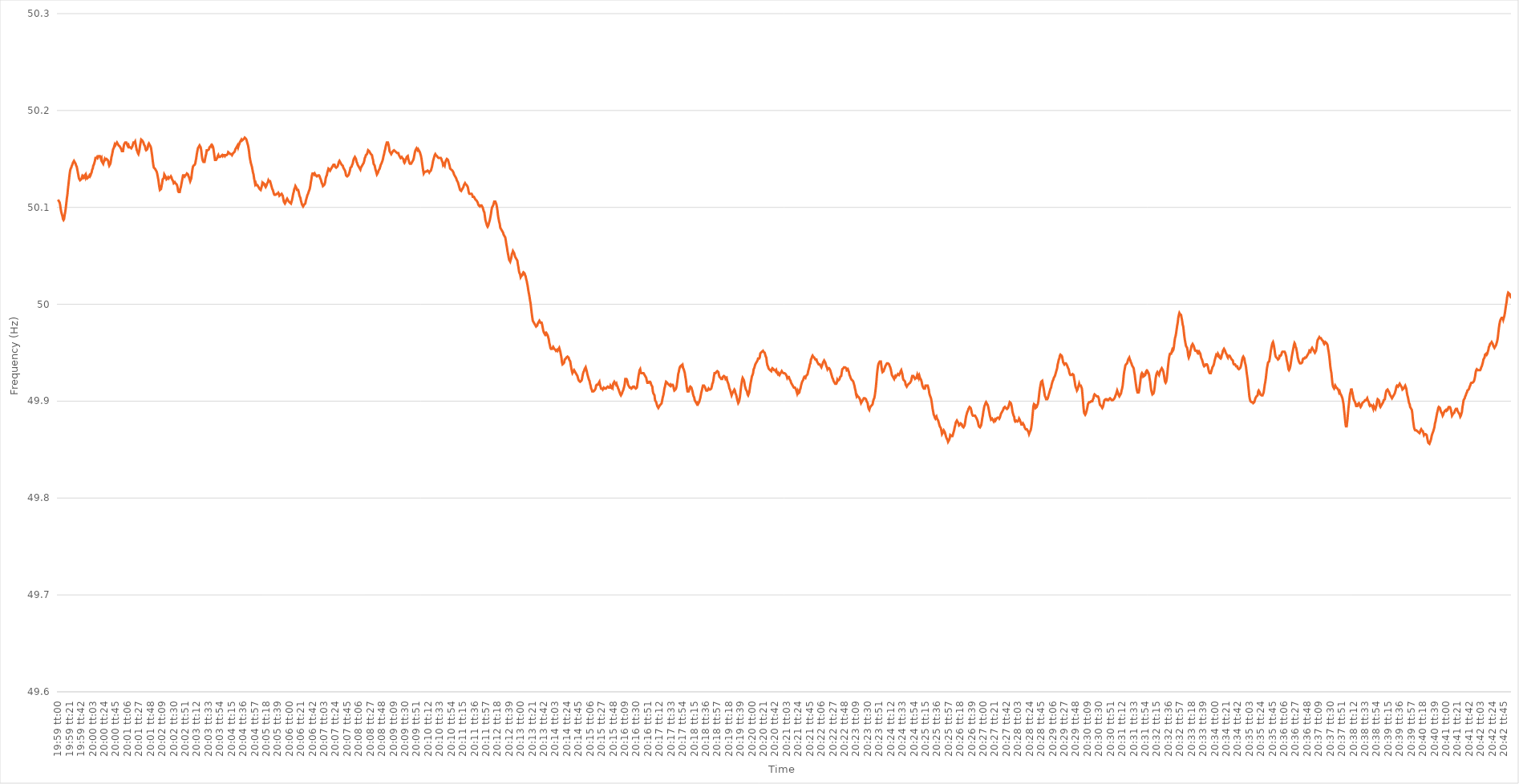
| Category | Series 0 |
|---|---|
| 0.8326388888888889 | 50.108 |
| 0.8326504629629629 | 50.107 |
| 0.832662037037037 | 50.107 |
| 0.8326736111111112 | 50.105 |
| 0.8326851851851852 | 50.102 |
| 0.8326967592592592 | 50.098 |
| 0.8327083333333333 | 50.095 |
| 0.8327199074074074 | 50.093 |
| 0.8327314814814816 | 50.091 |
| 0.8327430555555555 | 50.088 |
| 0.8327546296296297 | 50.087 |
| 0.8327662037037037 | 50.088 |
| 0.8327777777777778 | 50.092 |
| 0.8327893518518518 | 50.095 |
| 0.8328009259259259 | 50.099 |
| 0.8328125000000001 | 50.104 |
| 0.8328240740740741 | 50.109 |
| 0.8328356481481481 | 50.113 |
| 0.8328472222222222 | 50.119 |
| 0.8328587962962963 | 50.124 |
| 0.8328703703703703 | 50.129 |
| 0.8328819444444444 | 50.134 |
| 0.8328935185185186 | 50.138 |
| 0.8329050925925926 | 50.14 |
| 0.8329166666666666 | 50.141 |
| 0.8329282407407407 | 50.143 |
| 0.8329398148148148 | 50.144 |
| 0.832951388888889 | 50.146 |
| 0.8329629629629629 | 50.147 |
| 0.832974537037037 | 50.148 |
| 0.8329861111111111 | 50.147 |
| 0.8329976851851852 | 50.146 |
| 0.8330092592592592 | 50.145 |
| 0.8330208333333333 | 50.143 |
| 0.8330324074074075 | 50.142 |
| 0.8330439814814815 | 50.139 |
| 0.8330555555555555 | 50.136 |
| 0.8330671296296296 | 50.133 |
| 0.8330787037037037 | 50.13 |
| 0.8330902777777777 | 50.129 |
| 0.8331018518518518 | 50.128 |
| 0.833113425925926 | 50.128 |
| 0.833125 | 50.129 |
| 0.833136574074074 | 50.13 |
| 0.8331481481481481 | 50.132 |
| 0.8331597222222222 | 50.131 |
| 0.8331712962962964 | 50.132 |
| 0.8331828703703703 | 50.131 |
| 0.8331944444444445 | 50.132 |
| 0.8332060185185185 | 50.133 |
| 0.8332175925925926 | 50.131 |
| 0.8332291666666666 | 50.133 |
| 0.8332407407407407 | 50.131 |
| 0.8332523148148149 | 50.13 |
| 0.8332638888888889 | 50.13 |
| 0.833275462962963 | 50.131 |
| 0.833287037037037 | 50.132 |
| 0.8332986111111111 | 50.133 |
| 0.8333101851851853 | 50.132 |
| 0.8333217592592592 | 50.133 |
| 0.8333333333333334 | 50.135 |
| 0.8333449074074074 | 50.136 |
| 0.8333564814814814 | 50.139 |
| 0.8333680555555555 | 50.14 |
| 0.8333796296296296 | 50.143 |
| 0.8333912037037038 | 50.144 |
| 0.8334027777777777 | 50.146 |
| 0.8334143518518519 | 50.148 |
| 0.8334259259259259 | 50.151 |
| 0.8334375 | 50.151 |
| 0.833449074074074 | 50.151 |
| 0.8334606481481481 | 50.152 |
| 0.8334722222222223 | 50.151 |
| 0.8334837962962963 | 50.152 |
| 0.8334953703703704 | 50.153 |
| 0.8335069444444444 | 50.153 |
| 0.8335185185185185 | 50.153 |
| 0.8335300925925927 | 50.152 |
| 0.8335416666666666 | 50.15 |
| 0.8335532407407408 | 50.151 |
| 0.8335648148148148 | 50.147 |
| 0.8335763888888889 | 50.146 |
| 0.8335879629629629 | 50.145 |
| 0.833599537037037 | 50.147 |
| 0.8336111111111112 | 50.148 |
| 0.8336226851851851 | 50.15 |
| 0.8336342592592593 | 50.149 |
| 0.8336458333333333 | 50.149 |
| 0.8336574074074075 | 50.15 |
| 0.8336689814814814 | 50.15 |
| 0.8336805555555555 | 50.149 |
| 0.8336921296296297 | 50.148 |
| 0.8337037037037037 | 50.145 |
| 0.8337152777777778 | 50.143 |
| 0.8337268518518518 | 50.143 |
| 0.833738425925926 | 50.145 |
| 0.8337500000000001 | 50.148 |
| 0.833761574074074 | 50.152 |
| 0.8337731481481482 | 50.154 |
| 0.8337847222222222 | 50.157 |
| 0.8337962962962964 | 50.16 |
| 0.8338078703703703 | 50.161 |
| 0.8338194444444444 | 50.163 |
| 0.8338310185185186 | 50.165 |
| 0.8338425925925925 | 50.164 |
| 0.8338541666666667 | 50.164 |
| 0.8338657407407407 | 50.166 |
| 0.8338773148148149 | 50.167 |
| 0.8338888888888888 | 50.166 |
| 0.8339004629629629 | 50.165 |
| 0.8339120370370371 | 50.164 |
| 0.8339236111111111 | 50.164 |
| 0.8339351851851852 | 50.163 |
| 0.8339467592592592 | 50.163 |
| 0.8339583333333334 | 50.161 |
| 0.8339699074074075 | 50.16 |
| 0.8339814814814814 | 50.158 |
| 0.8339930555555556 | 50.158 |
| 0.8340046296296296 | 50.158 |
| 0.8340162037037038 | 50.162 |
| 0.8340277777777777 | 50.165 |
| 0.8340393518518519 | 50.165 |
| 0.834050925925926 | 50.167 |
| 0.8340624999999999 | 50.167 |
| 0.8340740740740741 | 50.167 |
| 0.8340856481481481 | 50.166 |
| 0.8340972222222223 | 50.164 |
| 0.8341087962962962 | 50.163 |
| 0.8341203703703703 | 50.164 |
| 0.8341319444444445 | 50.162 |
| 0.8341435185185185 | 50.162 |
| 0.8341550925925926 | 50.162 |
| 0.8341666666666666 | 50.162 |
| 0.8341782407407408 | 50.161 |
| 0.8341898148148149 | 50.162 |
| 0.8342013888888888 | 50.163 |
| 0.834212962962963 | 50.165 |
| 0.834224537037037 | 50.167 |
| 0.8342361111111112 | 50.167 |
| 0.8342476851851851 | 50.167 |
| 0.8342592592592593 | 50.168 |
| 0.8342708333333334 | 50.165 |
| 0.8342824074074073 | 50.162 |
| 0.8342939814814815 | 50.159 |
| 0.8343055555555555 | 50.158 |
| 0.8343171296296297 | 50.156 |
| 0.8343287037037036 | 50.155 |
| 0.8343402777777778 | 50.157 |
| 0.8343518518518519 | 50.16 |
| 0.8343634259259259 | 50.164 |
| 0.834375 | 50.167 |
| 0.834386574074074 | 50.17 |
| 0.8343981481481482 | 50.17 |
| 0.8344097222222223 | 50.169 |
| 0.8344212962962962 | 50.168 |
| 0.8344328703703704 | 50.167 |
| 0.8344444444444444 | 50.165 |
| 0.8344560185185186 | 50.164 |
| 0.8344675925925925 | 50.163 |
| 0.8344791666666667 | 50.16 |
| 0.8344907407407408 | 50.159 |
| 0.8345023148148148 | 50.159 |
| 0.8345138888888889 | 50.16 |
| 0.8345254629629629 | 50.162 |
| 0.8345370370370371 | 50.165 |
| 0.834548611111111 | 50.166 |
| 0.8345601851851852 | 50.166 |
| 0.8345717592592593 | 50.164 |
| 0.8345833333333333 | 50.163 |
| 0.8345949074074074 | 50.161 |
| 0.8346064814814814 | 50.157 |
| 0.8346180555555556 | 50.153 |
| 0.8346296296296297 | 50.148 |
| 0.8346412037037036 | 50.144 |
| 0.8346527777777778 | 50.141 |
| 0.8346643518518518 | 50.141 |
| 0.834675925925926 | 50.14 |
| 0.8346874999999999 | 50.139 |
| 0.8346990740740741 | 50.138 |
| 0.8347106481481482 | 50.137 |
| 0.8347222222222223 | 50.135 |
| 0.8347337962962963 | 50.132 |
| 0.8347453703703703 | 50.129 |
| 0.8347569444444445 | 50.125 |
| 0.8347685185185184 | 50.121 |
| 0.8347800925925926 | 50.118 |
| 0.8347916666666667 | 50.118 |
| 0.8348032407407407 | 50.119 |
| 0.8348148148148148 | 50.122 |
| 0.8348263888888888 | 50.125 |
| 0.834837962962963 | 50.129 |
| 0.8348495370370371 | 50.129 |
| 0.834861111111111 | 50.13 |
| 0.8348726851851852 | 50.134 |
| 0.8348842592592592 | 50.134 |
| 0.8348958333333334 | 50.132 |
| 0.8349074074074073 | 50.131 |
| 0.8349189814814815 | 50.129 |
| 0.8349305555555556 | 50.129 |
| 0.8349421296296297 | 50.13 |
| 0.8349537037037037 | 50.131 |
| 0.8349652777777777 | 50.13 |
| 0.8349768518518519 | 50.131 |
| 0.834988425925926 | 50.131 |
| 0.835 | 50.131 |
| 0.8350115740740741 | 50.132 |
| 0.8350231481481482 | 50.131 |
| 0.8350347222222222 | 50.129 |
| 0.8350462962962962 | 50.128 |
| 0.8350578703703704 | 50.127 |
| 0.8350694444444445 | 50.125 |
| 0.8350810185185185 | 50.125 |
| 0.8350925925925926 | 50.126 |
| 0.8351041666666666 | 50.125 |
| 0.8351157407407408 | 50.125 |
| 0.8351273148148147 | 50.124 |
| 0.8351388888888889 | 50.123 |
| 0.835150462962963 | 50.121 |
| 0.8351620370370371 | 50.117 |
| 0.8351736111111111 | 50.116 |
| 0.8351851851851851 | 50.116 |
| 0.8351967592592593 | 50.116 |
| 0.8352083333333334 | 50.119 |
| 0.8352199074074074 | 50.121 |
| 0.8352314814814815 | 50.124 |
| 0.8352430555555556 | 50.127 |
| 0.8352546296296296 | 50.13 |
| 0.8352662037037036 | 50.133 |
| 0.8352777777777778 | 50.133 |
| 0.8352893518518519 | 50.133 |
| 0.8353009259259259 | 50.132 |
| 0.8353125 | 50.133 |
| 0.835324074074074 | 50.133 |
| 0.8353356481481482 | 50.134 |
| 0.8353472222222221 | 50.135 |
| 0.8353587962962963 | 50.135 |
| 0.8353703703703704 | 50.134 |
| 0.8353819444444445 | 50.132 |
| 0.8353935185185185 | 50.131 |
| 0.8354050925925925 | 50.129 |
| 0.8354166666666667 | 50.127 |
| 0.8354282407407408 | 50.127 |
| 0.8354398148148148 | 50.13 |
| 0.8354513888888889 | 50.135 |
| 0.835462962962963 | 50.139 |
| 0.835474537037037 | 50.142 |
| 0.835486111111111 | 50.143 |
| 0.8354976851851852 | 50.143 |
| 0.8355092592592593 | 50.144 |
| 0.8355208333333333 | 50.145 |
| 0.8355324074074074 | 50.148 |
| 0.8355439814814815 | 50.151 |
| 0.8355555555555556 | 50.155 |
| 0.8355671296296295 | 50.158 |
| 0.8355787037037037 | 50.161 |
| 0.8355902777777778 | 50.161 |
| 0.8356018518518519 | 50.163 |
| 0.8356134259259259 | 50.164 |
| 0.835625 | 50.164 |
| 0.8356365740740741 | 50.162 |
| 0.8356481481481483 | 50.159 |
| 0.8356597222222222 | 50.154 |
| 0.8356712962962963 | 50.15 |
| 0.8356828703703704 | 50.148 |
| 0.8356944444444445 | 50.147 |
| 0.8357060185185184 | 50.147 |
| 0.8357175925925926 | 50.147 |
| 0.8357291666666667 | 50.15 |
| 0.8357407407407407 | 50.153 |
| 0.8357523148148148 | 50.155 |
| 0.8357638888888889 | 50.159 |
| 0.835775462962963 | 50.159 |
| 0.8357870370370369 | 50.159 |
| 0.8357986111111111 | 50.159 |
| 0.8358101851851852 | 50.16 |
| 0.8358217592592593 | 50.162 |
| 0.8358333333333333 | 50.162 |
| 0.8358449074074074 | 50.163 |
| 0.8358564814814815 | 50.164 |
| 0.8358680555555557 | 50.163 |
| 0.8358796296296296 | 50.164 |
| 0.8358912037037037 | 50.163 |
| 0.8359027777777778 | 50.161 |
| 0.8359143518518519 | 50.157 |
| 0.8359259259259259 | 50.153 |
| 0.8359375 | 50.149 |
| 0.8359490740740741 | 50.149 |
| 0.8359606481481481 | 50.149 |
| 0.8359722222222222 | 50.149 |
| 0.8359837962962963 | 50.151 |
| 0.8359953703703704 | 50.153 |
| 0.8360069444444443 | 50.154 |
| 0.8360185185185185 | 50.152 |
| 0.8360300925925926 | 50.152 |
| 0.8360416666666667 | 50.152 |
| 0.8360532407407407 | 50.152 |
| 0.8360648148148148 | 50.153 |
| 0.8360763888888889 | 50.153 |
| 0.8360879629629631 | 50.154 |
| 0.836099537037037 | 50.153 |
| 0.8361111111111111 | 50.154 |
| 0.8361226851851852 | 50.154 |
| 0.8361342592592593 | 50.154 |
| 0.8361458333333333 | 50.153 |
| 0.8361574074074074 | 50.154 |
| 0.8361689814814816 | 50.154 |
| 0.8361805555555555 | 50.154 |
| 0.8361921296296296 | 50.154 |
| 0.8362037037037037 | 50.155 |
| 0.8362152777777778 | 50.157 |
| 0.8362268518518517 | 50.157 |
| 0.8362384259259259 | 50.156 |
| 0.83625 | 50.156 |
| 0.8362615740740741 | 50.155 |
| 0.8362731481481481 | 50.155 |
| 0.8362847222222222 | 50.155 |
| 0.8362962962962963 | 50.154 |
| 0.8363078703703705 | 50.155 |
| 0.8363194444444444 | 50.156 |
| 0.8363310185185185 | 50.156 |
| 0.8363425925925926 | 50.157 |
| 0.8363541666666667 | 50.158 |
| 0.8363657407407407 | 50.16 |
| 0.8363773148148148 | 50.161 |
| 0.836388888888889 | 50.162 |
| 0.836400462962963 | 50.163 |
| 0.836412037037037 | 50.164 |
| 0.8364236111111111 | 50.162 |
| 0.8364351851851852 | 50.164 |
| 0.8364467592592592 | 50.165 |
| 0.8364583333333333 | 50.167 |
| 0.8364699074074075 | 50.168 |
| 0.8364814814814815 | 50.169 |
| 0.8364930555555555 | 50.17 |
| 0.8365046296296296 | 50.169 |
| 0.8365162037037037 | 50.169 |
| 0.8365277777777779 | 50.17 |
| 0.8365393518518518 | 50.17 |
| 0.836550925925926 | 50.171 |
| 0.8365625 | 50.172 |
| 0.8365740740740741 | 50.172 |
| 0.8365856481481481 | 50.171 |
| 0.8365972222222222 | 50.17 |
| 0.8366087962962964 | 50.17 |
| 0.8366203703703704 | 50.166 |
| 0.8366319444444444 | 50.164 |
| 0.8366435185185185 | 50.161 |
| 0.8366550925925926 | 50.157 |
| 0.8366666666666666 | 50.152 |
| 0.8366782407407407 | 50.149 |
| 0.8366898148148149 | 50.146 |
| 0.8367013888888889 | 50.144 |
| 0.8367129629629629 | 50.142 |
| 0.836724537037037 | 50.139 |
| 0.8367361111111111 | 50.136 |
| 0.8367476851851853 | 50.134 |
| 0.8367592592592592 | 50.13 |
| 0.8367708333333334 | 50.127 |
| 0.8367824074074074 | 50.124 |
| 0.8367939814814815 | 50.125 |
| 0.8368055555555555 | 50.123 |
| 0.8368171296296296 | 50.123 |
| 0.8368287037037038 | 50.123 |
| 0.8368402777777778 | 50.122 |
| 0.8368518518518518 | 50.121 |
| 0.8368634259259259 | 50.12 |
| 0.836875 | 50.119 |
| 0.836886574074074 | 50.119 |
| 0.8368981481481481 | 50.118 |
| 0.8369097222222223 | 50.12 |
| 0.8369212962962963 | 50.122 |
| 0.8369328703703703 | 50.125 |
| 0.8369444444444444 | 50.124 |
| 0.8369560185185185 | 50.125 |
| 0.8369675925925927 | 50.125 |
| 0.8369791666666666 | 50.124 |
| 0.8369907407407408 | 50.122 |
| 0.8370023148148148 | 50.121 |
| 0.837013888888889 | 50.122 |
| 0.8370254629629629 | 50.122 |
| 0.837037037037037 | 50.125 |
| 0.8370486111111112 | 50.126 |
| 0.8370601851851852 | 50.128 |
| 0.8370717592592593 | 50.127 |
| 0.8370833333333333 | 50.127 |
| 0.8370949074074074 | 50.127 |
| 0.8371064814814816 | 50.125 |
| 0.8371180555555555 | 50.123 |
| 0.8371296296296297 | 50.121 |
| 0.8371412037037037 | 50.119 |
| 0.8371527777777777 | 50.118 |
| 0.8371643518518518 | 50.116 |
| 0.8371759259259259 | 50.114 |
| 0.8371875000000001 | 50.113 |
| 0.837199074074074 | 50.113 |
| 0.8372106481481482 | 50.113 |
| 0.8372222222222222 | 50.113 |
| 0.8372337962962964 | 50.114 |
| 0.8372453703703703 | 50.114 |
| 0.8372569444444444 | 50.114 |
| 0.8372685185185186 | 50.115 |
| 0.8372800925925926 | 50.114 |
| 0.8372916666666667 | 50.112 |
| 0.8373032407407407 | 50.112 |
| 0.8373148148148148 | 50.113 |
| 0.837326388888889 | 50.113 |
| 0.8373379629629629 | 50.114 |
| 0.8373495370370371 | 50.113 |
| 0.8373611111111111 | 50.112 |
| 0.8373726851851852 | 50.109 |
| 0.8373842592592592 | 50.106 |
| 0.8373958333333333 | 50.105 |
| 0.8374074074074075 | 50.104 |
| 0.8374189814814814 | 50.105 |
| 0.8374305555555556 | 50.107 |
| 0.8374421296296296 | 50.108 |
| 0.8374537037037038 | 50.109 |
| 0.8374652777777777 | 50.108 |
| 0.8374768518518518 | 50.107 |
| 0.837488425925926 | 50.106 |
| 0.8375 | 50.106 |
| 0.8375115740740741 | 50.105 |
| 0.8375231481481481 | 50.105 |
| 0.8375347222222222 | 50.104 |
| 0.8375462962962964 | 50.106 |
| 0.8375578703703703 | 50.108 |
| 0.8375694444444445 | 50.111 |
| 0.8375810185185185 | 50.114 |
| 0.8375925925925927 | 50.116 |
| 0.8376041666666666 | 50.119 |
| 0.8376157407407407 | 50.12 |
| 0.8376273148148149 | 50.122 |
| 0.8376388888888888 | 50.122 |
| 0.837650462962963 | 50.12 |
| 0.837662037037037 | 50.118 |
| 0.8376736111111112 | 50.118 |
| 0.8376851851851851 | 50.118 |
| 0.8376967592592592 | 50.116 |
| 0.8377083333333334 | 50.113 |
| 0.8377199074074074 | 50.111 |
| 0.8377314814814815 | 50.11 |
| 0.8377430555555555 | 50.107 |
| 0.8377546296296297 | 50.107 |
| 0.8377662037037038 | 50.103 |
| 0.8377777777777777 | 50.102 |
| 0.8377893518518519 | 50.101 |
| 0.8378009259259259 | 50.101 |
| 0.8378125000000001 | 50.103 |
| 0.837824074074074 | 50.103 |
| 0.8378356481481481 | 50.104 |
| 0.8378472222222223 | 50.107 |
| 0.8378587962962962 | 50.109 |
| 0.8378703703703704 | 50.111 |
| 0.8378819444444444 | 50.113 |
| 0.8378935185185186 | 50.114 |
| 0.8379050925925925 | 50.116 |
| 0.8379166666666666 | 50.116 |
| 0.8379282407407408 | 50.119 |
| 0.8379398148148148 | 50.122 |
| 0.8379513888888889 | 50.126 |
| 0.8379629629629629 | 50.129 |
| 0.8379745370370371 | 50.133 |
| 0.8379861111111112 | 50.135 |
| 0.8379976851851851 | 50.135 |
| 0.8380092592592593 | 50.135 |
| 0.8380208333333333 | 50.134 |
| 0.8380324074074075 | 50.135 |
| 0.8380439814814814 | 50.135 |
| 0.8380555555555556 | 50.133 |
| 0.8380671296296297 | 50.133 |
| 0.8380787037037036 | 50.132 |
| 0.8380902777777778 | 50.132 |
| 0.8381018518518518 | 50.133 |
| 0.838113425925926 | 50.133 |
| 0.8381249999999999 | 50.133 |
| 0.838136574074074 | 50.132 |
| 0.8381481481481482 | 50.13 |
| 0.8381597222222222 | 50.129 |
| 0.8381712962962963 | 50.127 |
| 0.8381828703703703 | 50.125 |
| 0.8381944444444445 | 50.124 |
| 0.8382060185185186 | 50.122 |
| 0.8382175925925925 | 50.122 |
| 0.8382291666666667 | 50.123 |
| 0.8382407407407407 | 50.124 |
| 0.8382523148148149 | 50.126 |
| 0.8382638888888888 | 50.13 |
| 0.838275462962963 | 50.132 |
| 0.8382870370370371 | 50.133 |
| 0.8382986111111111 | 50.136 |
| 0.8383101851851852 | 50.138 |
| 0.8383217592592592 | 50.14 |
| 0.8383333333333334 | 50.14 |
| 0.8383449074074073 | 50.139 |
| 0.8383564814814815 | 50.138 |
| 0.8383680555555556 | 50.138 |
| 0.8383796296296296 | 50.14 |
| 0.8383912037037037 | 50.141 |
| 0.8384027777777777 | 50.142 |
| 0.8384143518518519 | 50.143 |
| 0.838425925925926 | 50.144 |
| 0.8384375 | 50.144 |
| 0.8384490740740741 | 50.144 |
| 0.8384606481481481 | 50.142 |
| 0.8384722222222223 | 50.142 |
| 0.8384837962962962 | 50.141 |
| 0.8384953703703704 | 50.141 |
| 0.8385069444444445 | 50.142 |
| 0.8385185185185186 | 50.143 |
| 0.8385300925925926 | 50.145 |
| 0.8385416666666666 | 50.147 |
| 0.8385532407407408 | 50.148 |
| 0.8385648148148147 | 50.148 |
| 0.8385763888888889 | 50.146 |
| 0.838587962962963 | 50.145 |
| 0.838599537037037 | 50.144 |
| 0.8386111111111111 | 50.144 |
| 0.8386226851851851 | 50.143 |
| 0.8386342592592593 | 50.141 |
| 0.8386458333333334 | 50.14 |
| 0.8386574074074074 | 50.139 |
| 0.8386689814814815 | 50.138 |
| 0.8386805555555555 | 50.136 |
| 0.8386921296296297 | 50.133 |
| 0.8387037037037036 | 50.133 |
| 0.8387152777777778 | 50.132 |
| 0.8387268518518519 | 50.132 |
| 0.838738425925926 | 50.133 |
| 0.83875 | 50.134 |
| 0.838761574074074 | 50.136 |
| 0.8387731481481482 | 50.138 |
| 0.8387847222222221 | 50.141 |
| 0.8387962962962963 | 50.141 |
| 0.8388078703703704 | 50.142 |
| 0.8388194444444445 | 50.144 |
| 0.8388310185185185 | 50.145 |
| 0.8388425925925925 | 50.148 |
| 0.8388541666666667 | 50.15 |
| 0.8388657407407408 | 50.151 |
| 0.8388773148148148 | 50.152 |
| 0.8388888888888889 | 50.151 |
| 0.838900462962963 | 50.15 |
| 0.8389120370370371 | 50.147 |
| 0.838923611111111 | 50.146 |
| 0.8389351851851852 | 50.144 |
| 0.8389467592592593 | 50.143 |
| 0.8389583333333334 | 50.142 |
| 0.8389699074074074 | 50.141 |
| 0.8389814814814814 | 50.14 |
| 0.8389930555555556 | 50.139 |
| 0.8390046296296297 | 50.141 |
| 0.8390162037037037 | 50.141 |
| 0.8390277777777778 | 50.143 |
| 0.8390393518518519 | 50.143 |
| 0.8390509259259259 | 50.145 |
| 0.8390624999999999 | 50.146 |
| 0.8390740740740741 | 50.148 |
| 0.8390856481481482 | 50.151 |
| 0.8390972222222222 | 50.152 |
| 0.8391087962962963 | 50.154 |
| 0.8391203703703703 | 50.154 |
| 0.8391319444444445 | 50.155 |
| 0.8391435185185184 | 50.157 |
| 0.8391550925925926 | 50.159 |
| 0.8391666666666667 | 50.159 |
| 0.8391782407407408 | 50.158 |
| 0.8391898148148148 | 50.157 |
| 0.8392013888888888 | 50.156 |
| 0.839212962962963 | 50.155 |
| 0.8392245370370371 | 50.155 |
| 0.8392361111111111 | 50.154 |
| 0.8392476851851852 | 50.151 |
| 0.8392592592592593 | 50.149 |
| 0.8392708333333333 | 50.145 |
| 0.8392824074074073 | 50.144 |
| 0.8392939814814815 | 50.143 |
| 0.8393055555555556 | 50.14 |
| 0.8393171296296296 | 50.138 |
| 0.8393287037037037 | 50.136 |
| 0.8393402777777778 | 50.134 |
| 0.8393518518518519 | 50.135 |
| 0.8393634259259258 | 50.136 |
| 0.839375 | 50.138 |
| 0.8393865740740741 | 50.138 |
| 0.8393981481481482 | 50.14 |
| 0.8394097222222222 | 50.142 |
| 0.8394212962962962 | 50.144 |
| 0.8394328703703704 | 50.145 |
| 0.8394444444444445 | 50.145 |
| 0.8394560185185185 | 50.148 |
| 0.8394675925925926 | 50.15 |
| 0.8394791666666667 | 50.153 |
| 0.8394907407407407 | 50.155 |
| 0.8395023148148147 | 50.158 |
| 0.8395138888888889 | 50.16 |
| 0.839525462962963 | 50.163 |
| 0.839537037037037 | 50.165 |
| 0.8395486111111111 | 50.167 |
| 0.8395601851851852 | 50.167 |
| 0.8395717592592593 | 50.167 |
| 0.8395833333333332 | 50.165 |
| 0.8395949074074074 | 50.162 |
| 0.8396064814814815 | 50.158 |
| 0.8396180555555556 | 50.157 |
| 0.8396296296296296 | 50.156 |
| 0.8396412037037037 | 50.155 |
| 0.8396527777777778 | 50.156 |
| 0.839664351851852 | 50.157 |
| 0.8396759259259259 | 50.158 |
| 0.8396875 | 50.158 |
| 0.8396990740740741 | 50.159 |
| 0.8397106481481482 | 50.159 |
| 0.8397222222222221 | 50.158 |
| 0.8397337962962963 | 50.158 |
| 0.8397453703703704 | 50.157 |
| 0.8397569444444444 | 50.157 |
| 0.8397685185185185 | 50.156 |
| 0.8397800925925926 | 50.156 |
| 0.8397916666666667 | 50.156 |
| 0.8398032407407406 | 50.154 |
| 0.8398148148148148 | 50.153 |
| 0.8398263888888889 | 50.153 |
| 0.839837962962963 | 50.151 |
| 0.839849537037037 | 50.151 |
| 0.8398611111111111 | 50.152 |
| 0.8398726851851852 | 50.151 |
| 0.8398842592592594 | 50.151 |
| 0.8398958333333333 | 50.15 |
| 0.8399074074074074 | 50.147 |
| 0.8399189814814815 | 50.146 |
| 0.8399305555555556 | 50.147 |
| 0.8399421296296296 | 50.149 |
| 0.8399537037037037 | 50.15 |
| 0.8399652777777779 | 50.152 |
| 0.8399768518518518 | 50.152 |
| 0.8399884259259259 | 50.153 |
| 0.84 | 50.15 |
| 0.8400115740740741 | 50.148 |
| 0.840023148148148 | 50.146 |
| 0.8400347222222222 | 50.145 |
| 0.8400462962962963 | 50.145 |
| 0.8400578703703704 | 50.145 |
| 0.8400694444444444 | 50.145 |
| 0.8400810185185185 | 50.147 |
| 0.8400925925925926 | 50.148 |
| 0.8401041666666668 | 50.149 |
| 0.8401157407407407 | 50.151 |
| 0.8401273148148148 | 50.154 |
| 0.8401388888888889 | 50.157 |
| 0.840150462962963 | 50.159 |
| 0.840162037037037 | 50.159 |
| 0.8401736111111111 | 50.161 |
| 0.8401851851851853 | 50.16 |
| 0.8401967592592593 | 50.159 |
| 0.8402083333333333 | 50.16 |
| 0.8402199074074074 | 50.16 |
| 0.8402314814814815 | 50.158 |
| 0.8402430555555555 | 50.157 |
| 0.8402546296296296 | 50.155 |
| 0.8402662037037038 | 50.153 |
| 0.8402777777777778 | 50.15 |
| 0.8402893518518518 | 50.146 |
| 0.8403009259259259 | 50.142 |
| 0.8403125 | 50.138 |
| 0.8403240740740742 | 50.135 |
| 0.8403356481481481 | 50.136 |
| 0.8403472222222222 | 50.136 |
| 0.8403587962962963 | 50.137 |
| 0.8403703703703704 | 50.137 |
| 0.8403819444444444 | 50.137 |
| 0.8403935185185185 | 50.137 |
| 0.8404050925925927 | 50.138 |
| 0.8404166666666667 | 50.138 |
| 0.8404282407407407 | 50.137 |
| 0.8404398148148148 | 50.136 |
| 0.8404513888888889 | 50.137 |
| 0.8404629629629629 | 50.137 |
| 0.840474537037037 | 50.138 |
| 0.8404861111111112 | 50.14 |
| 0.8404976851851852 | 50.142 |
| 0.8405092592592592 | 50.145 |
| 0.8405208333333333 | 50.148 |
| 0.8405324074074074 | 50.15 |
| 0.8405439814814816 | 50.152 |
| 0.8405555555555555 | 50.154 |
| 0.8405671296296297 | 50.155 |
| 0.8405787037037037 | 50.154 |
| 0.8405902777777778 | 50.154 |
| 0.8406018518518518 | 50.153 |
| 0.8406134259259259 | 50.152 |
| 0.8406250000000001 | 50.152 |
| 0.8406365740740741 | 50.151 |
| 0.8406481481481481 | 50.151 |
| 0.8406597222222222 | 50.151 |
| 0.8406712962962963 | 50.151 |
| 0.8406828703703703 | 50.151 |
| 0.8406944444444444 | 50.15 |
| 0.8407060185185186 | 50.148 |
| 0.8407175925925926 | 50.147 |
| 0.8407291666666666 | 50.144 |
| 0.8407407407407407 | 50.145 |
| 0.8407523148148148 | 50.144 |
| 0.840763888888889 | 50.143 |
| 0.8407754629629629 | 50.146 |
| 0.840787037037037 | 50.148 |
| 0.8407986111111111 | 50.149 |
| 0.8408101851851852 | 50.15 |
| 0.8408217592592592 | 50.15 |
| 0.8408333333333333 | 50.149 |
| 0.8408449074074075 | 50.147 |
| 0.8408564814814815 | 50.145 |
| 0.8408680555555555 | 50.143 |
| 0.8408796296296296 | 50.14 |
| 0.8408912037037037 | 50.14 |
| 0.8409027777777779 | 50.139 |
| 0.8409143518518518 | 50.139 |
| 0.840925925925926 | 50.138 |
| 0.8409375 | 50.137 |
| 0.840949074074074 | 50.136 |
| 0.8409606481481481 | 50.134 |
| 0.8409722222222222 | 50.134 |
| 0.8409837962962964 | 50.132 |
| 0.8409953703703703 | 50.131 |
| 0.8410069444444445 | 50.13 |
| 0.8410185185185185 | 50.128 |
| 0.8410300925925926 | 50.128 |
| 0.8410416666666666 | 50.126 |
| 0.8410532407407407 | 50.124 |
| 0.8410648148148149 | 50.122 |
| 0.8410763888888889 | 50.12 |
| 0.841087962962963 | 50.118 |
| 0.841099537037037 | 50.118 |
| 0.8411111111111111 | 50.117 |
| 0.8411226851851853 | 50.118 |
| 0.8411342592592592 | 50.119 |
| 0.8411458333333334 | 50.119 |
| 0.8411574074074074 | 50.121 |
| 0.8411689814814814 | 50.123 |
| 0.8411805555555555 | 50.124 |
| 0.8411921296296296 | 50.125 |
| 0.8412037037037038 | 50.124 |
| 0.8412152777777777 | 50.124 |
| 0.8412268518518519 | 50.123 |
| 0.8412384259259259 | 50.122 |
| 0.84125 | 50.121 |
| 0.841261574074074 | 50.118 |
| 0.8412731481481481 | 50.115 |
| 0.8412847222222223 | 50.114 |
| 0.8412962962962963 | 50.114 |
| 0.8413078703703704 | 50.114 |
| 0.8413194444444444 | 50.114 |
| 0.8413310185185185 | 50.114 |
| 0.8413425925925927 | 50.113 |
| 0.8413541666666666 | 50.111 |
| 0.8413657407407408 | 50.111 |
| 0.8413773148148148 | 50.111 |
| 0.8413888888888889 | 50.11 |
| 0.8414004629629629 | 50.109 |
| 0.841412037037037 | 50.108 |
| 0.8414236111111112 | 50.108 |
| 0.8414351851851851 | 50.107 |
| 0.8414467592592593 | 50.106 |
| 0.8414583333333333 | 50.105 |
| 0.8414699074074075 | 50.103 |
| 0.8414814814814814 | 50.102 |
| 0.8414930555555555 | 50.102 |
| 0.8415046296296297 | 50.101 |
| 0.8415162037037037 | 50.102 |
| 0.8415277777777778 | 50.102 |
| 0.8415393518518518 | 50.102 |
| 0.841550925925926 | 50.101 |
| 0.8415625000000001 | 50.1 |
| 0.841574074074074 | 50.098 |
| 0.8415856481481482 | 50.096 |
| 0.8415972222222222 | 50.095 |
| 0.8416087962962964 | 50.091 |
| 0.8416203703703703 | 50.087 |
| 0.8416319444444444 | 50.085 |
| 0.8416435185185186 | 50.083 |
| 0.8416550925925925 | 50.081 |
| 0.8416666666666667 | 50.08 |
| 0.8416782407407407 | 50.081 |
| 0.8416898148148149 | 50.083 |
| 0.8417013888888888 | 50.085 |
| 0.8417129629629629 | 50.087 |
| 0.8417245370370371 | 50.09 |
| 0.8417361111111111 | 50.093 |
| 0.8417476851851852 | 50.097 |
| 0.8417592592592592 | 50.1 |
| 0.8417708333333334 | 50.1 |
| 0.8417824074074075 | 50.102 |
| 0.8417939814814814 | 50.104 |
| 0.8418055555555556 | 50.106 |
| 0.8418171296296296 | 50.106 |
| 0.8418287037037038 | 50.106 |
| 0.8418402777777777 | 50.106 |
| 0.8418518518518519 | 50.103 |
| 0.841863425925926 | 50.1 |
| 0.8418749999999999 | 50.096 |
| 0.8418865740740741 | 50.091 |
| 0.8418981481481481 | 50.088 |
| 0.8419097222222223 | 50.085 |
| 0.8419212962962962 | 50.083 |
| 0.8419328703703703 | 50.079 |
| 0.8419444444444445 | 50.078 |
| 0.8419560185185185 | 50.077 |
| 0.8419675925925926 | 50.076 |
| 0.8419791666666666 | 50.076 |
| 0.8419907407407408 | 50.074 |
| 0.8420023148148149 | 50.072 |
| 0.8420138888888888 | 50.071 |
| 0.842025462962963 | 50.071 |
| 0.842037037037037 | 50.069 |
| 0.8420486111111112 | 50.066 |
| 0.8420601851851851 | 50.062 |
| 0.8420717592592593 | 50.059 |
| 0.8420833333333334 | 50.055 |
| 0.8420949074074073 | 50.052 |
| 0.8421064814814815 | 50.049 |
| 0.8421180555555555 | 50.046 |
| 0.8421296296296297 | 50.045 |
| 0.8421412037037036 | 50.044 |
| 0.8421527777777778 | 50.046 |
| 0.8421643518518519 | 50.048 |
| 0.8421759259259259 | 50.052 |
| 0.8421875 | 50.053 |
| 0.842199074074074 | 50.055 |
| 0.8422106481481482 | 50.055 |
| 0.8422222222222223 | 50.053 |
| 0.8422337962962962 | 50.051 |
| 0.8422453703703704 | 50.049 |
| 0.8422569444444444 | 50.048 |
| 0.8422685185185186 | 50.048 |
| 0.8422800925925925 | 50.046 |
| 0.8422916666666667 | 50.045 |
| 0.8423032407407408 | 50.041 |
| 0.8423148148148148 | 50.038 |
| 0.8423263888888889 | 50.034 |
| 0.8423379629629629 | 50.032 |
| 0.8423495370370371 | 50.031 |
| 0.842361111111111 | 50.028 |
| 0.8423726851851852 | 50.029 |
| 0.8423842592592593 | 50.029 |
| 0.8423958333333333 | 50.03 |
| 0.8424074074074074 | 50.032 |
| 0.8424189814814814 | 50.033 |
| 0.8424305555555556 | 50.033 |
| 0.8424421296296297 | 50.032 |
| 0.8424537037037036 | 50.03 |
| 0.8424652777777778 | 50.029 |
| 0.8424768518518518 | 50.026 |
| 0.842488425925926 | 50.024 |
| 0.8424999999999999 | 50.021 |
| 0.8425115740740741 | 50.018 |
| 0.8425231481481482 | 50.014 |
| 0.8425347222222223 | 50.011 |
| 0.8425462962962963 | 50.008 |
| 0.8425578703703703 | 50.004 |
| 0.8425694444444445 | 50.001 |
| 0.8425810185185184 | 49.996 |
| 0.8425925925925926 | 49.991 |
| 0.8426041666666667 | 49.987 |
| 0.8426157407407407 | 49.983 |
| 0.8426273148148148 | 49.982 |
| 0.8426388888888888 | 49.981 |
| 0.842650462962963 | 49.981 |
| 0.8426620370370371 | 49.979 |
| 0.842673611111111 | 49.978 |
| 0.8426851851851852 | 49.977 |
| 0.8426967592592592 | 49.977 |
| 0.8427083333333334 | 49.978 |
| 0.8427199074074073 | 49.98 |
| 0.8427314814814815 | 49.981 |
| 0.8427430555555556 | 49.982 |
| 0.8427546296296297 | 49.983 |
| 0.8427662037037037 | 49.982 |
| 0.8427777777777777 | 49.981 |
| 0.8427893518518519 | 49.981 |
| 0.842800925925926 | 49.981 |
| 0.8428125 | 49.979 |
| 0.8428240740740741 | 49.976 |
| 0.8428356481481482 | 49.973 |
| 0.8428472222222222 | 49.971 |
| 0.8428587962962962 | 49.97 |
| 0.8428703703703704 | 49.969 |
| 0.8428819444444445 | 49.97 |
| 0.8428935185185185 | 49.969 |
| 0.8429050925925926 | 49.97 |
| 0.8429166666666666 | 49.969 |
| 0.8429282407407408 | 49.968 |
| 0.8429398148148147 | 49.966 |
| 0.8429513888888889 | 49.964 |
| 0.842962962962963 | 49.96 |
| 0.8429745370370371 | 49.958 |
| 0.8429861111111111 | 49.955 |
| 0.8429976851851851 | 49.954 |
| 0.8430092592592593 | 49.954 |
| 0.8430208333333334 | 49.954 |
| 0.8430324074074074 | 49.955 |
| 0.8430439814814815 | 49.956 |
| 0.8430555555555556 | 49.955 |
| 0.8430671296296296 | 49.954 |
| 0.8430787037037036 | 49.954 |
| 0.8430902777777778 | 49.953 |
| 0.8431018518518519 | 49.952 |
| 0.8431134259259259 | 49.952 |
| 0.843125 | 49.953 |
| 0.843136574074074 | 49.952 |
| 0.8431481481481482 | 49.953 |
| 0.8431597222222221 | 49.954 |
| 0.8431712962962963 | 49.955 |
| 0.8431828703703704 | 49.953 |
| 0.8431944444444445 | 49.951 |
| 0.8432060185185185 | 49.948 |
| 0.8432175925925925 | 49.945 |
| 0.8432291666666667 | 49.94 |
| 0.8432407407407408 | 49.938 |
| 0.8432523148148148 | 49.938 |
| 0.8432638888888889 | 49.939 |
| 0.843275462962963 | 49.94 |
| 0.843287037037037 | 49.943 |
| 0.843298611111111 | 49.943 |
| 0.8433101851851852 | 49.944 |
| 0.8433217592592593 | 49.945 |
| 0.8433333333333333 | 49.945 |
| 0.8433449074074074 | 49.946 |
| 0.8433564814814815 | 49.946 |
| 0.8433680555555556 | 49.945 |
| 0.8433796296296295 | 49.943 |
| 0.8433912037037037 | 49.942 |
| 0.8434027777777778 | 49.941 |
| 0.8434143518518519 | 49.937 |
| 0.8434259259259259 | 49.934 |
| 0.8434375 | 49.931 |
| 0.8434490740740741 | 49.929 |
| 0.8434606481481483 | 49.93 |
| 0.8434722222222222 | 49.93 |
| 0.8434837962962963 | 49.932 |
| 0.8434953703703704 | 49.932 |
| 0.8435069444444445 | 49.93 |
| 0.8435185185185184 | 49.929 |
| 0.8435300925925926 | 49.928 |
| 0.8435416666666667 | 49.928 |
| 0.8435532407407407 | 49.926 |
| 0.8435648148148148 | 49.924 |
| 0.8435763888888889 | 49.922 |
| 0.843587962962963 | 49.921 |
| 0.8435995370370369 | 49.921 |
| 0.8436111111111111 | 49.92 |
| 0.8436226851851852 | 49.92 |
| 0.8436342592592593 | 49.921 |
| 0.8436458333333333 | 49.922 |
| 0.8436574074074074 | 49.925 |
| 0.8436689814814815 | 49.928 |
| 0.8436805555555557 | 49.93 |
| 0.8436921296296296 | 49.931 |
| 0.8437037037037037 | 49.933 |
| 0.8437152777777778 | 49.934 |
| 0.8437268518518519 | 49.935 |
| 0.8437384259259259 | 49.933 |
| 0.84375 | 49.931 |
| 0.8437615740740741 | 49.928 |
| 0.8437731481481481 | 49.926 |
| 0.8437847222222222 | 49.924 |
| 0.8437962962962963 | 49.922 |
| 0.8438078703703704 | 49.921 |
| 0.8438194444444443 | 49.918 |
| 0.8438310185185185 | 49.916 |
| 0.8438425925925926 | 49.913 |
| 0.8438541666666667 | 49.912 |
| 0.8438657407407407 | 49.91 |
| 0.8438773148148148 | 49.91 |
| 0.8438888888888889 | 49.91 |
| 0.8439004629629631 | 49.91 |
| 0.843912037037037 | 49.911 |
| 0.8439236111111111 | 49.912 |
| 0.8439351851851852 | 49.913 |
| 0.8439467592592593 | 49.916 |
| 0.8439583333333333 | 49.917 |
| 0.8439699074074074 | 49.917 |
| 0.8439814814814816 | 49.917 |
| 0.8439930555555555 | 49.918 |
| 0.8440046296296296 | 49.919 |
| 0.8440162037037037 | 49.92 |
| 0.8440277777777778 | 49.917 |
| 0.8440393518518517 | 49.915 |
| 0.8440509259259259 | 49.913 |
| 0.8440625 | 49.913 |
| 0.8440740740740741 | 49.913 |
| 0.8440856481481481 | 49.912 |
| 0.8440972222222222 | 49.913 |
| 0.8441087962962963 | 49.914 |
| 0.8441203703703705 | 49.914 |
| 0.8441319444444444 | 49.913 |
| 0.8441435185185185 | 49.913 |
| 0.8441550925925926 | 49.913 |
| 0.8441666666666667 | 49.914 |
| 0.8441782407407407 | 49.914 |
| 0.8441898148148148 | 49.915 |
| 0.844201388888889 | 49.915 |
| 0.844212962962963 | 49.914 |
| 0.844224537037037 | 49.914 |
| 0.8442361111111111 | 49.914 |
| 0.8442476851851852 | 49.916 |
| 0.8442592592592592 | 49.915 |
| 0.8442708333333333 | 49.914 |
| 0.8442824074074075 | 49.915 |
| 0.8442939814814815 | 49.914 |
| 0.8443055555555555 | 49.918 |
| 0.8443171296296296 | 49.918 |
| 0.8443287037037037 | 49.92 |
| 0.8443402777777779 | 49.919 |
| 0.8443518518518518 | 49.918 |
| 0.844363425925926 | 49.917 |
| 0.844375 | 49.918 |
| 0.8443865740740741 | 49.916 |
| 0.8443981481481481 | 49.915 |
| 0.8444097222222222 | 49.913 |
| 0.8444212962962964 | 49.912 |
| 0.8444328703703704 | 49.91 |
| 0.8444444444444444 | 49.91 |
| 0.8444560185185185 | 49.907 |
| 0.8444675925925926 | 49.906 |
| 0.8444791666666666 | 49.906 |
| 0.8444907407407407 | 49.908 |
| 0.8445023148148149 | 49.91 |
| 0.8445138888888889 | 49.911 |
| 0.8445254629629629 | 49.913 |
| 0.844537037037037 | 49.915 |
| 0.8445486111111111 | 49.918 |
| 0.8445601851851853 | 49.923 |
| 0.8445717592592592 | 49.923 |
| 0.8445833333333334 | 49.923 |
| 0.8445949074074074 | 49.922 |
| 0.8446064814814815 | 49.92 |
| 0.8446180555555555 | 49.917 |
| 0.8446296296296296 | 49.916 |
| 0.8446412037037038 | 49.915 |
| 0.8446527777777778 | 49.914 |
| 0.8446643518518518 | 49.914 |
| 0.8446759259259259 | 49.914 |
| 0.8446875 | 49.913 |
| 0.844699074074074 | 49.913 |
| 0.8447106481481481 | 49.914 |
| 0.8447222222222223 | 49.915 |
| 0.8447337962962963 | 49.915 |
| 0.8447453703703703 | 49.915 |
| 0.8447569444444444 | 49.914 |
| 0.8447685185185185 | 49.914 |
| 0.8447800925925927 | 49.913 |
| 0.8447916666666666 | 49.913 |
| 0.8448032407407408 | 49.914 |
| 0.8448148148148148 | 49.918 |
| 0.844826388888889 | 49.922 |
| 0.8448379629629629 | 49.926 |
| 0.844849537037037 | 49.929 |
| 0.8448611111111112 | 49.932 |
| 0.8448726851851852 | 49.933 |
| 0.8448842592592593 | 49.93 |
| 0.8448958333333333 | 49.929 |
| 0.8449074074074074 | 49.929 |
| 0.8449189814814816 | 49.929 |
| 0.8449305555555555 | 49.929 |
| 0.8449421296296297 | 49.929 |
| 0.8449537037037037 | 49.928 |
| 0.8449652777777777 | 49.927 |
| 0.8449768518518518 | 49.926 |
| 0.8449884259259259 | 49.926 |
| 0.8450000000000001 | 49.924 |
| 0.845011574074074 | 49.921 |
| 0.8450231481481482 | 49.919 |
| 0.8450347222222222 | 49.919 |
| 0.8450462962962964 | 49.919 |
| 0.8450578703703703 | 49.92 |
| 0.8450694444444444 | 49.92 |
| 0.8450810185185186 | 49.92 |
| 0.8450925925925926 | 49.919 |
| 0.8451041666666667 | 49.917 |
| 0.8451157407407407 | 49.916 |
| 0.8451273148148148 | 49.915 |
| 0.845138888888889 | 49.91 |
| 0.8451504629629629 | 49.908 |
| 0.8451620370370371 | 49.907 |
| 0.8451736111111111 | 49.906 |
| 0.8451851851851852 | 49.901 |
| 0.8451967592592592 | 49.9 |
| 0.8452083333333333 | 49.899 |
| 0.8452199074074075 | 49.897 |
| 0.8452314814814814 | 49.895 |
| 0.8452430555555556 | 49.894 |
| 0.8452546296296296 | 49.893 |
| 0.8452662037037038 | 49.894 |
| 0.8452777777777777 | 49.895 |
| 0.8452893518518518 | 49.896 |
| 0.845300925925926 | 49.896 |
| 0.8453125 | 49.897 |
| 0.8453240740740741 | 49.898 |
| 0.8453356481481481 | 49.901 |
| 0.8453472222222222 | 49.904 |
| 0.8453587962962964 | 49.906 |
| 0.8453703703703703 | 49.909 |
| 0.8453819444444445 | 49.913 |
| 0.8453935185185185 | 49.915 |
| 0.8454050925925927 | 49.918 |
| 0.8454166666666666 | 49.92 |
| 0.8454282407407407 | 49.92 |
| 0.8454398148148149 | 49.919 |
| 0.8454513888888888 | 49.918 |
| 0.845462962962963 | 49.918 |
| 0.845474537037037 | 49.917 |
| 0.8454861111111112 | 49.917 |
| 0.8454976851851851 | 49.916 |
| 0.8455092592592592 | 49.917 |
| 0.8455208333333334 | 49.916 |
| 0.8455324074074074 | 49.917 |
| 0.8455439814814815 | 49.917 |
| 0.8455555555555555 | 49.917 |
| 0.8455671296296297 | 49.916 |
| 0.8455787037037038 | 49.913 |
| 0.8455902777777777 | 49.911 |
| 0.8456018518518519 | 49.911 |
| 0.8456134259259259 | 49.912 |
| 0.8456250000000001 | 49.913 |
| 0.845636574074074 | 49.915 |
| 0.8456481481481481 | 49.919 |
| 0.8456597222222223 | 49.923 |
| 0.8456712962962962 | 49.928 |
| 0.8456828703703704 | 49.93 |
| 0.8456944444444444 | 49.933 |
| 0.8457060185185186 | 49.935 |
| 0.8457175925925925 | 49.936 |
| 0.8457291666666666 | 49.936 |
| 0.8457407407407408 | 49.937 |
| 0.8457523148148148 | 49.936 |
| 0.8457638888888889 | 49.937 |
| 0.8457754629629629 | 49.934 |
| 0.8457870370370371 | 49.933 |
| 0.8457986111111112 | 49.931 |
| 0.8458101851851851 | 49.929 |
| 0.8458217592592593 | 49.925 |
| 0.8458333333333333 | 49.922 |
| 0.8458449074074075 | 49.917 |
| 0.8458564814814814 | 49.913 |
| 0.8458680555555556 | 49.91 |
| 0.8458796296296297 | 49.91 |
| 0.8458912037037036 | 49.91 |
| 0.8459027777777778 | 49.912 |
| 0.8459143518518518 | 49.914 |
| 0.845925925925926 | 49.915 |
| 0.8459374999999999 | 49.915 |
| 0.845949074074074 | 49.914 |
| 0.8459606481481482 | 49.912 |
| 0.8459722222222222 | 49.91 |
| 0.8459837962962963 | 49.907 |
| 0.8459953703703703 | 49.905 |
| 0.8460069444444445 | 49.904 |
| 0.8460185185185186 | 49.901 |
| 0.8460300925925925 | 49.9 |
| 0.8460416666666667 | 49.899 |
| 0.8460532407407407 | 49.898 |
| 0.8460648148148149 | 49.897 |
| 0.8460763888888888 | 49.898 |
| 0.846087962962963 | 49.897 |
| 0.8460995370370371 | 49.898 |
| 0.846111111111111 | 49.899 |
| 0.8461226851851852 | 49.901 |
| 0.8461342592592592 | 49.903 |
| 0.8461458333333334 | 49.906 |
| 0.8461574074074073 | 49.909 |
| 0.8461689814814815 | 49.911 |
| 0.8461805555555556 | 49.914 |
| 0.8461921296296296 | 49.916 |
| 0.8462037037037037 | 49.916 |
| 0.8462152777777777 | 49.916 |
| 0.8462268518518519 | 49.915 |
| 0.846238425925926 | 49.914 |
| 0.84625 | 49.912 |
| 0.8462615740740741 | 49.911 |
| 0.8462731481481481 | 49.911 |
| 0.8462847222222223 | 49.911 |
| 0.8462962962962962 | 49.912 |
| 0.8463078703703704 | 49.913 |
| 0.8463194444444445 | 49.912 |
| 0.8463310185185186 | 49.912 |
| 0.8463425925925926 | 49.912 |
| 0.8463541666666666 | 49.912 |
| 0.8463657407407408 | 49.913 |
| 0.8463773148148147 | 49.915 |
| 0.8463888888888889 | 49.918 |
| 0.846400462962963 | 49.919 |
| 0.846412037037037 | 49.922 |
| 0.8464236111111111 | 49.926 |
| 0.8464351851851851 | 49.929 |
| 0.8464467592592593 | 49.929 |
| 0.8464583333333334 | 49.929 |
| 0.8464699074074074 | 49.93 |
| 0.8464814814814815 | 49.93 |
| 0.8464930555555555 | 49.931 |
| 0.8465046296296297 | 49.931 |
| 0.8465162037037036 | 49.93 |
| 0.8465277777777778 | 49.927 |
| 0.8465393518518519 | 49.925 |
| 0.846550925925926 | 49.925 |
| 0.8465625 | 49.924 |
| 0.846574074074074 | 49.923 |
| 0.8465856481481482 | 49.923 |
| 0.8465972222222223 | 49.923 |
| 0.8466087962962963 | 49.925 |
| 0.8466203703703704 | 49.925 |
| 0.8466319444444445 | 49.926 |
| 0.8466435185185185 | 49.926 |
| 0.8466550925925925 | 49.925 |
| 0.8466666666666667 | 49.923 |
| 0.8466782407407408 | 49.923 |
| 0.8466898148148148 | 49.924 |
| 0.8467013888888889 | 49.921 |
| 0.846712962962963 | 49.921 |
| 0.8467245370370371 | 49.918 |
| 0.846736111111111 | 49.916 |
| 0.8467476851851852 | 49.913 |
| 0.8467592592592593 | 49.912 |
| 0.8467708333333334 | 49.91 |
| 0.8467824074074074 | 49.908 |
| 0.8467939814814814 | 49.906 |
| 0.8468055555555556 | 49.906 |
| 0.8468171296296297 | 49.909 |
| 0.8468287037037037 | 49.91 |
| 0.8468402777777778 | 49.911 |
| 0.8468518518518519 | 49.912 |
| 0.8468634259259259 | 49.911 |
| 0.8468749999999999 | 49.908 |
| 0.8468865740740741 | 49.907 |
| 0.8468981481481482 | 49.905 |
| 0.8469097222222222 | 49.902 |
| 0.8469212962962963 | 49.9 |
| 0.8469328703703703 | 49.898 |
| 0.8469444444444445 | 49.899 |
| 0.8469560185185184 | 49.901 |
| 0.8469675925925926 | 49.904 |
| 0.8469791666666667 | 49.909 |
| 0.8469907407407408 | 49.914 |
| 0.8470023148148148 | 49.918 |
| 0.8470138888888888 | 49.922 |
| 0.847025462962963 | 49.924 |
| 0.8470370370370371 | 49.923 |
| 0.8470486111111111 | 49.922 |
| 0.8470601851851852 | 49.92 |
| 0.8470717592592593 | 49.916 |
| 0.8470833333333333 | 49.914 |
| 0.8470949074074073 | 49.912 |
| 0.8471064814814815 | 49.911 |
| 0.8471180555555556 | 49.91 |
| 0.8471296296296296 | 49.907 |
| 0.8471412037037037 | 49.906 |
| 0.8471527777777778 | 49.906 |
| 0.8471643518518519 | 49.909 |
| 0.8471759259259258 | 49.913 |
| 0.8471875 | 49.917 |
| 0.8471990740740741 | 49.92 |
| 0.8472106481481482 | 49.923 |
| 0.8472222222222222 | 49.926 |
| 0.8472337962962962 | 49.927 |
| 0.8472453703703704 | 49.929 |
| 0.8472569444444445 | 49.933 |
| 0.8472685185185185 | 49.934 |
| 0.8472800925925926 | 49.936 |
| 0.8472916666666667 | 49.938 |
| 0.8473032407407407 | 49.939 |
| 0.8473148148148147 | 49.94 |
| 0.8473263888888889 | 49.941 |
| 0.847337962962963 | 49.942 |
| 0.847349537037037 | 49.944 |
| 0.8473611111111111 | 49.944 |
| 0.8473726851851852 | 49.944 |
| 0.8473842592592593 | 49.945 |
| 0.8473958333333332 | 49.949 |
| 0.8474074074074074 | 49.95 |
| 0.8474189814814815 | 49.95 |
| 0.8474305555555556 | 49.951 |
| 0.8474421296296296 | 49.951 |
| 0.8474537037037037 | 49.952 |
| 0.8474652777777778 | 49.951 |
| 0.847476851851852 | 49.951 |
| 0.8474884259259259 | 49.95 |
| 0.8475 | 49.948 |
| 0.8475115740740741 | 49.946 |
| 0.8475231481481482 | 49.945 |
| 0.8475347222222221 | 49.94 |
| 0.8475462962962963 | 49.937 |
| 0.8475578703703704 | 49.936 |
| 0.8475694444444444 | 49.934 |
| 0.8475810185185185 | 49.933 |
| 0.8475925925925926 | 49.933 |
| 0.8476041666666667 | 49.932 |
| 0.8476157407407406 | 49.932 |
| 0.8476273148148148 | 49.931 |
| 0.8476388888888889 | 49.933 |
| 0.847650462962963 | 49.934 |
| 0.847662037037037 | 49.934 |
| 0.8476736111111111 | 49.933 |
| 0.8476851851851852 | 49.932 |
| 0.8476967592592594 | 49.932 |
| 0.8477083333333333 | 49.932 |
| 0.8477199074074074 | 49.931 |
| 0.8477314814814815 | 49.932 |
| 0.8477430555555556 | 49.93 |
| 0.8477546296296296 | 49.929 |
| 0.8477662037037037 | 49.928 |
| 0.8477777777777779 | 49.929 |
| 0.8477893518518518 | 49.928 |
| 0.8478009259259259 | 49.927 |
| 0.8478125 | 49.928 |
| 0.8478240740740741 | 49.929 |
| 0.847835648148148 | 49.93 |
| 0.8478472222222222 | 49.931 |
| 0.8478587962962963 | 49.93 |
| 0.8478703703703704 | 49.93 |
| 0.8478819444444444 | 49.929 |
| 0.8478935185185185 | 49.929 |
| 0.8479050925925926 | 49.929 |
| 0.8479166666666668 | 49.929 |
| 0.8479282407407407 | 49.928 |
| 0.8479398148148148 | 49.927 |
| 0.8479513888888889 | 49.926 |
| 0.847962962962963 | 49.924 |
| 0.847974537037037 | 49.925 |
| 0.8479861111111111 | 49.925 |
| 0.8479976851851853 | 49.925 |
| 0.8480092592592593 | 49.923 |
| 0.8480208333333333 | 49.922 |
| 0.8480324074074074 | 49.921 |
| 0.8480439814814815 | 49.919 |
| 0.8480555555555555 | 49.918 |
| 0.8480671296296296 | 49.917 |
| 0.8480787037037038 | 49.916 |
| 0.8480902777777778 | 49.915 |
| 0.8481018518518518 | 49.914 |
| 0.8481134259259259 | 49.914 |
| 0.848125 | 49.914 |
| 0.8481365740740742 | 49.914 |
| 0.8481481481481481 | 49.912 |
| 0.8481597222222222 | 49.91 |
| 0.8481712962962963 | 49.908 |
| 0.8481828703703704 | 49.91 |
| 0.8481944444444444 | 49.908 |
| 0.8482060185185185 | 49.908 |
| 0.8482175925925927 | 49.909 |
| 0.8482291666666667 | 49.912 |
| 0.8482407407407407 | 49.913 |
| 0.8482523148148148 | 49.916 |
| 0.8482638888888889 | 49.918 |
| 0.8482754629629629 | 49.92 |
| 0.848287037037037 | 49.921 |
| 0.8482986111111112 | 49.922 |
| 0.8483101851851852 | 49.924 |
| 0.8483217592592592 | 49.925 |
| 0.8483333333333333 | 49.925 |
| 0.8483449074074074 | 49.924 |
| 0.8483564814814816 | 49.926 |
| 0.8483680555555555 | 49.926 |
| 0.8483796296296297 | 49.927 |
| 0.8483912037037037 | 49.928 |
| 0.8484027777777778 | 49.931 |
| 0.8484143518518518 | 49.933 |
| 0.8484259259259259 | 49.935 |
| 0.8484375000000001 | 49.938 |
| 0.8484490740740741 | 49.939 |
| 0.8484606481481481 | 49.943 |
| 0.8484722222222222 | 49.944 |
| 0.8484837962962963 | 49.946 |
| 0.8484953703703703 | 49.947 |
| 0.8485069444444444 | 49.946 |
| 0.8485185185185186 | 49.946 |
| 0.8485300925925926 | 49.945 |
| 0.8485416666666666 | 49.944 |
| 0.8485532407407407 | 49.943 |
| 0.8485648148148148 | 49.943 |
| 0.848576388888889 | 49.943 |
| 0.8485879629629629 | 49.941 |
| 0.848599537037037 | 49.94 |
| 0.8486111111111111 | 49.939 |
| 0.8486226851851852 | 49.938 |
| 0.8486342592592592 | 49.938 |
| 0.8486458333333333 | 49.938 |
| 0.8486574074074075 | 49.937 |
| 0.8486689814814815 | 49.936 |
| 0.8486805555555555 | 49.935 |
| 0.8486921296296296 | 49.935 |
| 0.8487037037037037 | 49.938 |
| 0.8487152777777777 | 49.94 |
| 0.8487268518518518 | 49.94 |
| 0.848738425925926 | 49.942 |
| 0.84875 | 49.941 |
| 0.848761574074074 | 49.94 |
| 0.8487731481481481 | 49.938 |
| 0.8487847222222222 | 49.936 |
| 0.8487962962962964 | 49.935 |
| 0.8488078703703703 | 49.933 |
| 0.8488194444444445 | 49.934 |
| 0.8488310185185185 | 49.934 |
| 0.8488425925925926 | 49.934 |
| 0.8488541666666666 | 49.933 |
| 0.8488657407407407 | 49.932 |
| 0.8488773148148149 | 49.93 |
| 0.8488888888888889 | 49.928 |
| 0.848900462962963 | 49.926 |
| 0.848912037037037 | 49.924 |
| 0.8489236111111111 | 49.923 |
| 0.8489351851851853 | 49.921 |
| 0.8489467592592592 | 49.92 |
| 0.8489583333333334 | 49.919 |
| 0.8489699074074074 | 49.918 |
| 0.8489814814814814 | 49.918 |
| 0.8489930555555555 | 49.918 |
| 0.8490046296296296 | 49.919 |
| 0.8490162037037038 | 49.922 |
| 0.8490277777777777 | 49.921 |
| 0.8490393518518519 | 49.921 |
| 0.8490509259259259 | 49.922 |
| 0.8490625 | 49.923 |
| 0.849074074074074 | 49.925 |
| 0.8490856481481481 | 49.925 |
| 0.8490972222222223 | 49.926 |
| 0.8491087962962963 | 49.93 |
| 0.8491203703703704 | 49.933 |
| 0.8491319444444444 | 49.933 |
| 0.8491435185185185 | 49.934 |
| 0.8491550925925927 | 49.935 |
| 0.8491666666666666 | 49.935 |
| 0.8491782407407408 | 49.935 |
| 0.8491898148148148 | 49.935 |
| 0.849201388888889 | 49.934 |
| 0.8492129629629629 | 49.932 |
| 0.849224537037037 | 49.932 |
| 0.8492361111111112 | 49.933 |
| 0.8492476851851851 | 49.933 |
| 0.8492592592592593 | 49.93 |
| 0.8492708333333333 | 49.927 |
| 0.8492824074074075 | 49.926 |
| 0.8492939814814814 | 49.924 |
| 0.8493055555555555 | 49.923 |
| 0.8493171296296297 | 49.922 |
| 0.8493287037037037 | 49.922 |
| 0.8493402777777778 | 49.921 |
| 0.8493518518518518 | 49.92 |
| 0.849363425925926 | 49.918 |
| 0.8493750000000001 | 49.916 |
| 0.849386574074074 | 49.913 |
| 0.8493981481481482 | 49.911 |
| 0.8494097222222222 | 49.907 |
| 0.8494212962962964 | 49.905 |
| 0.8494328703703703 | 49.906 |
| 0.8494444444444444 | 49.905 |
| 0.8494560185185186 | 49.905 |
| 0.8494675925925925 | 49.904 |
| 0.8494791666666667 | 49.904 |
| 0.8494907407407407 | 49.902 |
| 0.8495023148148149 | 49.9 |
| 0.8495138888888888 | 49.898 |
| 0.8495254629629629 | 49.898 |
| 0.8495370370370371 | 49.9 |
| 0.8495486111111111 | 49.9 |
| 0.8495601851851852 | 49.902 |
| 0.8495717592592592 | 49.903 |
| 0.8495833333333334 | 49.903 |
| 0.8495949074074075 | 49.903 |
| 0.8496064814814814 | 49.903 |
| 0.8496180555555556 | 49.902 |
| 0.8496296296296296 | 49.9 |
| 0.8496412037037038 | 49.899 |
| 0.8496527777777777 | 49.898 |
| 0.8496643518518519 | 49.894 |
| 0.849675925925926 | 49.892 |
| 0.8496874999999999 | 49.891 |
| 0.8496990740740741 | 49.893 |
| 0.8497106481481481 | 49.894 |
| 0.8497222222222223 | 49.895 |
| 0.8497337962962962 | 49.895 |
| 0.8497453703703703 | 49.896 |
| 0.8497569444444445 | 49.897 |
| 0.8497685185185185 | 49.9 |
| 0.8497800925925926 | 49.902 |
| 0.8497916666666666 | 49.903 |
| 0.8498032407407408 | 49.906 |
| 0.8498148148148149 | 49.91 |
| 0.8498263888888888 | 49.915 |
| 0.849837962962963 | 49.921 |
| 0.849849537037037 | 49.928 |
| 0.8498611111111112 | 49.933 |
| 0.8498726851851851 | 49.937 |
| 0.8498842592592593 | 49.939 |
| 0.8498958333333334 | 49.94 |
| 0.8499074074074073 | 49.941 |
| 0.8499189814814815 | 49.941 |
| 0.8499305555555555 | 49.941 |
| 0.8499421296296297 | 49.936 |
| 0.8499537037037036 | 49.932 |
| 0.8499652777777778 | 49.93 |
| 0.8499768518518519 | 49.93 |
| 0.8499884259259259 | 49.931 |
| 0.85 | 49.933 |
| 0.850011574074074 | 49.934 |
| 0.8500231481481482 | 49.936 |
| 0.8500347222222223 | 49.937 |
| 0.8500462962962962 | 49.938 |
| 0.8500578703703704 | 49.939 |
| 0.8500694444444444 | 49.939 |
| 0.8500810185185186 | 49.939 |
| 0.8500925925925925 | 49.939 |
| 0.8501041666666667 | 49.938 |
| 0.8501157407407408 | 49.936 |
| 0.8501273148148148 | 49.935 |
| 0.8501388888888889 | 49.933 |
| 0.8501504629629629 | 49.93 |
| 0.8501620370370371 | 49.927 |
| 0.850173611111111 | 49.926 |
| 0.8501851851851852 | 49.925 |
| 0.8501967592592593 | 49.924 |
| 0.8502083333333333 | 49.923 |
| 0.8502199074074074 | 49.925 |
| 0.8502314814814814 | 49.926 |
| 0.8502430555555556 | 49.925 |
| 0.8502546296296297 | 49.926 |
| 0.8502662037037036 | 49.926 |
| 0.8502777777777778 | 49.927 |
| 0.8502893518518518 | 49.928 |
| 0.850300925925926 | 49.928 |
| 0.8503124999999999 | 49.927 |
| 0.8503240740740741 | 49.927 |
| 0.8503356481481482 | 49.929 |
| 0.8503472222222223 | 49.931 |
| 0.8503587962962963 | 49.932 |
| 0.8503703703703703 | 49.93 |
| 0.8503819444444445 | 49.928 |
| 0.8503935185185184 | 49.924 |
| 0.8504050925925926 | 49.922 |
| 0.8504166666666667 | 49.922 |
| 0.8504282407407407 | 49.921 |
| 0.8504398148148148 | 49.92 |
| 0.8504513888888888 | 49.917 |
| 0.850462962962963 | 49.916 |
| 0.8504745370370371 | 49.915 |
| 0.850486111111111 | 49.916 |
| 0.8504976851851852 | 49.917 |
| 0.8505092592592592 | 49.917 |
| 0.8505208333333334 | 49.918 |
| 0.8505324074074073 | 49.918 |
| 0.8505439814814815 | 49.919 |
| 0.8505555555555556 | 49.92 |
| 0.8505671296296297 | 49.921 |
| 0.8505787037037037 | 49.924 |
| 0.8505902777777777 | 49.926 |
| 0.8506018518518519 | 49.926 |
| 0.850613425925926 | 49.926 |
| 0.850625 | 49.925 |
| 0.8506365740740741 | 49.924 |
| 0.8506481481481482 | 49.923 |
| 0.8506597222222222 | 49.923 |
| 0.8506712962962962 | 49.924 |
| 0.8506828703703704 | 49.925 |
| 0.8506944444444445 | 49.927 |
| 0.8507060185185185 | 49.925 |
| 0.8507175925925926 | 49.926 |
| 0.8507291666666666 | 49.924 |
| 0.8507407407407408 | 49.926 |
| 0.8507523148148147 | 49.924 |
| 0.8507638888888889 | 49.924 |
| 0.850775462962963 | 49.922 |
| 0.8507870370370371 | 49.92 |
| 0.8507986111111111 | 49.917 |
| 0.8508101851851851 | 49.915 |
| 0.8508217592592593 | 49.914 |
| 0.8508333333333334 | 49.913 |
| 0.8508449074074074 | 49.913 |
| 0.8508564814814815 | 49.913 |
| 0.8508680555555556 | 49.916 |
| 0.8508796296296296 | 49.916 |
| 0.8508912037037036 | 49.916 |
| 0.8509027777777778 | 49.916 |
| 0.8509143518518519 | 49.916 |
| 0.8509259259259259 | 49.914 |
| 0.8509375 | 49.912 |
| 0.850949074074074 | 49.908 |
| 0.8509606481481482 | 49.906 |
| 0.8509722222222221 | 49.906 |
| 0.8509837962962963 | 49.903 |
| 0.8509953703703704 | 49.9 |
| 0.8510069444444445 | 49.896 |
| 0.8510185185185185 | 49.892 |
| 0.8510300925925925 | 49.889 |
| 0.8510416666666667 | 49.886 |
| 0.8510532407407408 | 49.885 |
| 0.8510648148148148 | 49.883 |
| 0.8510763888888889 | 49.882 |
| 0.851087962962963 | 49.883 |
| 0.851099537037037 | 49.884 |
| 0.851111111111111 | 49.882 |
| 0.8511226851851852 | 49.881 |
| 0.8511342592592593 | 49.88 |
| 0.8511458333333333 | 49.878 |
| 0.8511574074074074 | 49.876 |
| 0.8511689814814815 | 49.874 |
| 0.8511805555555556 | 49.873 |
| 0.8511921296296295 | 49.872 |
| 0.8512037037037037 | 49.869 |
| 0.8512152777777778 | 49.866 |
| 0.8512268518518519 | 49.867 |
| 0.8512384259259259 | 49.869 |
| 0.85125 | 49.87 |
| 0.8512615740740741 | 49.869 |
| 0.8512731481481483 | 49.868 |
| 0.8512847222222222 | 49.866 |
| 0.8512962962962963 | 49.864 |
| 0.8513078703703704 | 49.862 |
| 0.8513194444444444 | 49.861 |
| 0.8513310185185184 | 49.86 |
| 0.8513425925925926 | 49.858 |
| 0.8513541666666667 | 49.858 |
| 0.8513657407407407 | 49.86 |
| 0.8513773148148148 | 49.862 |
| 0.8513888888888889 | 49.865 |
| 0.851400462962963 | 49.865 |
| 0.8514120370370369 | 49.864 |
| 0.8514236111111111 | 49.864 |
| 0.8514351851851852 | 49.864 |
| 0.8514467592592593 | 49.866 |
| 0.8514583333333333 | 49.868 |
| 0.8514699074074074 | 49.87 |
| 0.8514814814814815 | 49.873 |
| 0.8514930555555557 | 49.875 |
| 0.8515046296296296 | 49.878 |
| 0.8515162037037037 | 49.879 |
| 0.8515277777777778 | 49.88 |
| 0.8515393518518519 | 49.879 |
| 0.8515509259259259 | 49.879 |
| 0.8515625 | 49.877 |
| 0.8515740740740741 | 49.875 |
| 0.8515856481481481 | 49.875 |
| 0.8515972222222222 | 49.876 |
| 0.8516087962962963 | 49.877 |
| 0.8516203703703704 | 49.877 |
| 0.8516319444444443 | 49.876 |
| 0.8516435185185185 | 49.874 |
| 0.8516550925925926 | 49.874 |
| 0.8516666666666667 | 49.873 |
| 0.8516782407407407 | 49.873 |
| 0.8516898148148148 | 49.875 |
| 0.8517013888888889 | 49.878 |
| 0.8517129629629631 | 49.882 |
| 0.851724537037037 | 49.885 |
| 0.8517361111111111 | 49.887 |
| 0.8517476851851852 | 49.889 |
| 0.8517592592592593 | 49.89 |
| 0.8517708333333333 | 49.892 |
| 0.8517824074074074 | 49.893 |
| 0.8517939814814816 | 49.894 |
| 0.8518055555555556 | 49.894 |
| 0.8518171296296296 | 49.893 |
| 0.8518287037037037 | 49.891 |
| 0.8518402777777778 | 49.888 |
| 0.8518518518518517 | 49.886 |
| 0.8518634259259259 | 49.885 |
| 0.851875 | 49.885 |
| 0.8518865740740741 | 49.885 |
| 0.8518981481481481 | 49.885 |
| 0.8519097222222222 | 49.885 |
| 0.8519212962962963 | 49.884 |
| 0.8519328703703705 | 49.883 |
| 0.8519444444444444 | 49.882 |
| 0.8519560185185185 | 49.882 |
| 0.8519675925925926 | 49.879 |
| 0.8519791666666667 | 49.876 |
| 0.8519907407407407 | 49.874 |
| 0.8520023148148148 | 49.874 |
| 0.852013888888889 | 49.873 |
| 0.852025462962963 | 49.873 |
| 0.852037037037037 | 49.875 |
| 0.8520486111111111 | 49.878 |
| 0.8520601851851852 | 49.882 |
| 0.8520717592592592 | 49.885 |
| 0.8520833333333333 | 49.889 |
| 0.8520949074074075 | 49.892 |
| 0.8521064814814815 | 49.895 |
| 0.8521180555555555 | 49.896 |
| 0.8521296296296296 | 49.898 |
| 0.8521412037037037 | 49.899 |
| 0.8521527777777779 | 49.899 |
| 0.8521643518518518 | 49.897 |
| 0.852175925925926 | 49.896 |
| 0.8521875 | 49.894 |
| 0.8521990740740741 | 49.891 |
| 0.8522106481481481 | 49.888 |
| 0.8522222222222222 | 49.885 |
| 0.8522337962962964 | 49.883 |
| 0.8522453703703704 | 49.881 |
| 0.8522569444444444 | 49.881 |
| 0.8522685185185185 | 49.882 |
| 0.8522800925925926 | 49.881 |
| 0.8522916666666666 | 49.88 |
| 0.8523032407407407 | 49.879 |
| 0.8523148148148149 | 49.88 |
| 0.8523263888888889 | 49.881 |
| 0.8523379629629629 | 49.88 |
| 0.852349537037037 | 49.881 |
| 0.8523611111111111 | 49.882 |
| 0.8523726851851853 | 49.882 |
| 0.8523842592592592 | 49.883 |
| 0.8523958333333334 | 49.883 |
| 0.8524074074074074 | 49.883 |
| 0.8524189814814815 | 49.882 |
| 0.8524305555555555 | 49.883 |
| 0.8524421296296296 | 49.885 |
| 0.8524537037037038 | 49.887 |
| 0.8524652777777778 | 49.887 |
| 0.8524768518518518 | 49.889 |
| 0.8524884259259259 | 49.89 |
| 0.8525 | 49.891 |
| 0.852511574074074 | 49.893 |
| 0.8525231481481481 | 49.893 |
| 0.8525347222222223 | 49.894 |
| 0.8525462962962963 | 49.893 |
| 0.8525578703703703 | 49.893 |
| 0.8525694444444444 | 49.893 |
| 0.8525810185185185 | 49.892 |
| 0.8525925925925927 | 49.892 |
| 0.8526041666666666 | 49.893 |
| 0.8526157407407408 | 49.895 |
| 0.8526273148148148 | 49.897 |
| 0.852638888888889 | 49.899 |
| 0.8526504629629629 | 49.899 |
| 0.852662037037037 | 49.898 |
| 0.8526736111111112 | 49.896 |
| 0.8526851851851852 | 49.893 |
| 0.8526967592592593 | 49.889 |
| 0.8527083333333333 | 49.887 |
| 0.8527199074074074 | 49.885 |
| 0.8527314814814816 | 49.884 |
| 0.8527430555555555 | 49.88 |
| 0.8527546296296297 | 49.879 |
| 0.8527662037037037 | 49.879 |
| 0.8527777777777777 | 49.88 |
| 0.8527893518518518 | 49.88 |
| 0.8528009259259259 | 49.879 |
| 0.8528125000000001 | 49.879 |
| 0.852824074074074 | 49.88 |
| 0.8528356481481482 | 49.882 |
| 0.8528472222222222 | 49.881 |
| 0.8528587962962964 | 49.881 |
| 0.8528703703703703 | 49.878 |
| 0.8528819444444444 | 49.876 |
| 0.8528935185185186 | 49.876 |
| 0.8529050925925926 | 49.876 |
| 0.8529166666666667 | 49.877 |
| 0.8529282407407407 | 49.876 |
| 0.8529398148148148 | 49.875 |
| 0.852951388888889 | 49.873 |
| 0.8529629629629629 | 49.872 |
| 0.8529745370370371 | 49.871 |
| 0.8529861111111111 | 49.871 |
| 0.8529976851851852 | 49.871 |
| 0.8530092592592592 | 49.87 |
| 0.8530208333333333 | 49.869 |
| 0.8530324074074075 | 49.868 |
| 0.8530439814814814 | 49.866 |
| 0.8530555555555556 | 49.866 |
| 0.8530671296296296 | 49.869 |
| 0.8530787037037038 | 49.87 |
| 0.8530902777777777 | 49.873 |
| 0.8531018518518518 | 49.877 |
| 0.853113425925926 | 49.883 |
| 0.853125 | 49.889 |
| 0.8531365740740741 | 49.895 |
| 0.8531481481481481 | 49.897 |
| 0.8531597222222222 | 49.897 |
| 0.8531712962962964 | 49.896 |
| 0.8531828703703703 | 49.893 |
| 0.8531944444444445 | 49.893 |
| 0.8532060185185185 | 49.894 |
| 0.8532175925925927 | 49.896 |
| 0.8532291666666666 | 49.897 |
| 0.8532407407407407 | 49.9 |
| 0.8532523148148149 | 49.905 |
| 0.8532638888888888 | 49.91 |
| 0.853275462962963 | 49.914 |
| 0.853287037037037 | 49.917 |
| 0.8532986111111112 | 49.92 |
| 0.8533101851851851 | 49.92 |
| 0.8533217592592592 | 49.921 |
| 0.8533333333333334 | 49.918 |
| 0.8533449074074074 | 49.915 |
| 0.8533564814814815 | 49.912 |
| 0.8533680555555555 | 49.908 |
| 0.8533796296296297 | 49.905 |
| 0.8533912037037038 | 49.904 |
| 0.8534027777777777 | 49.902 |
| 0.8534143518518519 | 49.902 |
| 0.8534259259259259 | 49.902 |
| 0.8534375000000001 | 49.903 |
| 0.853449074074074 | 49.905 |
| 0.8534606481481481 | 49.907 |
| 0.8534722222222223 | 49.909 |
| 0.8534837962962962 | 49.911 |
| 0.8534953703703704 | 49.913 |
| 0.8535069444444444 | 49.914 |
| 0.8535185185185186 | 49.917 |
| 0.8535300925925925 | 49.919 |
| 0.8535416666666666 | 49.921 |
| 0.8535532407407408 | 49.922 |
| 0.8535648148148148 | 49.924 |
| 0.8535763888888889 | 49.925 |
| 0.8535879629629629 | 49.926 |
| 0.8535995370370371 | 49.928 |
| 0.8536111111111112 | 49.93 |
| 0.8536226851851851 | 49.932 |
| 0.8536342592592593 | 49.934 |
| 0.8536458333333333 | 49.938 |
| 0.8536574074074075 | 49.94 |
| 0.8536689814814814 | 49.943 |
| 0.8536805555555556 | 49.944 |
| 0.8536921296296297 | 49.947 |
| 0.8537037037037036 | 49.948 |
| 0.8537152777777778 | 49.948 |
| 0.8537268518518518 | 49.947 |
| 0.853738425925926 | 49.946 |
| 0.8537499999999999 | 49.943 |
| 0.853761574074074 | 49.94 |
| 0.8537731481481482 | 49.939 |
| 0.8537847222222222 | 49.938 |
| 0.8537962962962963 | 49.939 |
| 0.8538078703703703 | 49.939 |
| 0.8538194444444445 | 49.939 |
| 0.8538310185185186 | 49.938 |
| 0.8538425925925925 | 49.937 |
| 0.8538541666666667 | 49.937 |
| 0.8538657407407407 | 49.934 |
| 0.8538773148148149 | 49.933 |
| 0.8538888888888888 | 49.93 |
| 0.853900462962963 | 49.928 |
| 0.8539120370370371 | 49.927 |
| 0.853923611111111 | 49.927 |
| 0.8539351851851852 | 49.927 |
| 0.8539467592592592 | 49.927 |
| 0.8539583333333334 | 49.928 |
| 0.8539699074074073 | 49.928 |
| 0.8539814814814815 | 49.927 |
| 0.8539930555555556 | 49.923 |
| 0.8540046296296296 | 49.92 |
| 0.8540162037037037 | 49.916 |
| 0.8540277777777777 | 49.914 |
| 0.8540393518518519 | 49.913 |
| 0.854050925925926 | 49.911 |
| 0.8540625 | 49.912 |
| 0.8540740740740741 | 49.914 |
| 0.8540856481481481 | 49.916 |
| 0.8540972222222223 | 49.918 |
| 0.8541087962962962 | 49.916 |
| 0.8541203703703704 | 49.916 |
| 0.8541319444444445 | 49.916 |
| 0.8541435185185186 | 49.916 |
| 0.8541550925925926 | 49.913 |
| 0.8541666666666666 | 49.907 |
| 0.8541782407407408 | 49.9 |
| 0.8541898148148147 | 49.893 |
| 0.8542013888888889 | 49.888 |
| 0.854212962962963 | 49.887 |
| 0.854224537037037 | 49.886 |
| 0.8542361111111111 | 49.887 |
| 0.8542476851851851 | 49.889 |
| 0.8542592592592593 | 49.891 |
| 0.8542708333333334 | 49.894 |
| 0.8542824074074074 | 49.897 |
| 0.8542939814814815 | 49.898 |
| 0.8543055555555555 | 49.899 |
| 0.8543171296296297 | 49.899 |
| 0.8543287037037036 | 49.899 |
| 0.8543402777777778 | 49.899 |
| 0.8543518518518519 | 49.9 |
| 0.854363425925926 | 49.9 |
| 0.854375 | 49.9 |
| 0.854386574074074 | 49.902 |
| 0.8543981481481482 | 49.903 |
| 0.8544097222222223 | 49.906 |
| 0.8544212962962963 | 49.907 |
| 0.8544328703703704 | 49.907 |
| 0.8544444444444445 | 49.906 |
| 0.8544560185185185 | 49.906 |
| 0.8544675925925925 | 49.905 |
| 0.8544791666666667 | 49.905 |
| 0.8544907407407408 | 49.905 |
| 0.8545023148148148 | 49.904 |
| 0.8545138888888889 | 49.902 |
| 0.854525462962963 | 49.898 |
| 0.8545370370370371 | 49.896 |
| 0.854548611111111 | 49.896 |
| 0.8545601851851852 | 49.895 |
| 0.8545717592592593 | 49.894 |
| 0.8545833333333334 | 49.893 |
| 0.8545949074074074 | 49.894 |
| 0.8546064814814814 | 49.896 |
| 0.8546180555555556 | 49.899 |
| 0.8546296296296297 | 49.901 |
| 0.8546412037037037 | 49.901 |
| 0.8546527777777778 | 49.902 |
| 0.8546643518518519 | 49.902 |
| 0.8546759259259259 | 49.902 |
| 0.8546874999999999 | 49.901 |
| 0.8546990740740741 | 49.901 |
| 0.8547106481481482 | 49.901 |
| 0.8547222222222222 | 49.902 |
| 0.8547337962962963 | 49.902 |
| 0.8547453703703703 | 49.903 |
| 0.8547569444444445 | 49.903 |
| 0.8547685185185184 | 49.902 |
| 0.8547800925925926 | 49.901 |
| 0.8547916666666667 | 49.901 |
| 0.8548032407407408 | 49.901 |
| 0.8548148148148148 | 49.901 |
| 0.8548263888888888 | 49.902 |
| 0.854837962962963 | 49.902 |
| 0.8548495370370371 | 49.904 |
| 0.8548611111111111 | 49.906 |
| 0.8548726851851852 | 49.907 |
| 0.8548842592592593 | 49.909 |
| 0.8548958333333333 | 49.911 |
| 0.8549074074074073 | 49.911 |
| 0.8549189814814815 | 49.908 |
| 0.8549305555555556 | 49.906 |
| 0.8549421296296296 | 49.905 |
| 0.8549537037037037 | 49.906 |
| 0.8549652777777778 | 49.907 |
| 0.8549768518518519 | 49.908 |
| 0.8549884259259258 | 49.911 |
| 0.855 | 49.913 |
| 0.8550115740740741 | 49.916 |
| 0.8550231481481482 | 49.921 |
| 0.8550347222222222 | 49.927 |
| 0.8550462962962962 | 49.931 |
| 0.8550578703703704 | 49.934 |
| 0.8550694444444445 | 49.937 |
| 0.8550810185185185 | 49.938 |
| 0.8550925925925926 | 49.938 |
| 0.8551041666666667 | 49.939 |
| 0.8551157407407407 | 49.941 |
| 0.8551273148148147 | 49.943 |
| 0.8551388888888889 | 49.944 |
| 0.855150462962963 | 49.945 |
| 0.855162037037037 | 49.943 |
| 0.8551736111111111 | 49.942 |
| 0.8551851851851852 | 49.94 |
| 0.8551967592592593 | 49.939 |
| 0.8552083333333332 | 49.937 |
| 0.8552199074074074 | 49.936 |
| 0.8552314814814815 | 49.936 |
| 0.8552430555555556 | 49.934 |
| 0.8552546296296296 | 49.93 |
| 0.8552662037037037 | 49.927 |
| 0.8552777777777778 | 49.922 |
| 0.855289351851852 | 49.918 |
| 0.8553009259259259 | 49.914 |
| 0.8553125 | 49.911 |
| 0.8553240740740741 | 49.909 |
| 0.8553356481481482 | 49.909 |
| 0.8553472222222221 | 49.909 |
| 0.8553587962962963 | 49.911 |
| 0.8553703703703704 | 49.916 |
| 0.8553819444444444 | 49.92 |
| 0.8553935185185185 | 49.925 |
| 0.8554050925925926 | 49.928 |
| 0.8554166666666667 | 49.929 |
| 0.8554282407407406 | 49.928 |
| 0.8554398148148148 | 49.926 |
| 0.8554513888888889 | 49.927 |
| 0.855462962962963 | 49.926 |
| 0.855474537037037 | 49.926 |
| 0.8554861111111111 | 49.927 |
| 0.8554976851851852 | 49.93 |
| 0.8555092592592594 | 49.931 |
| 0.8555208333333333 | 49.93 |
| 0.8555324074074074 | 49.931 |
| 0.8555439814814815 | 49.931 |
| 0.8555555555555556 | 49.929 |
| 0.8555671296296296 | 49.927 |
| 0.8555787037037037 | 49.923 |
| 0.8555902777777779 | 49.92 |
| 0.8556018518518519 | 49.915 |
| 0.8556134259259259 | 49.911 |
| 0.855625 | 49.909 |
| 0.8556365740740741 | 49.907 |
| 0.855648148148148 | 49.907 |
| 0.8556597222222222 | 49.908 |
| 0.8556712962962963 | 49.91 |
| 0.8556828703703704 | 49.914 |
| 0.8556944444444444 | 49.919 |
| 0.8557060185185185 | 49.924 |
| 0.8557175925925926 | 49.927 |
| 0.8557291666666668 | 49.929 |
| 0.8557407407407407 | 49.93 |
| 0.8557523148148148 | 49.929 |
| 0.8557638888888889 | 49.929 |
| 0.855775462962963 | 49.927 |
| 0.855787037037037 | 49.929 |
| 0.8557986111111111 | 49.931 |
| 0.8558101851851853 | 49.932 |
| 0.8558217592592593 | 49.933 |
| 0.8558333333333333 | 49.934 |
| 0.8558449074074074 | 49.934 |
| 0.8558564814814815 | 49.932 |
| 0.8558680555555555 | 49.93 |
| 0.8558796296296296 | 49.927 |
| 0.8558912037037038 | 49.923 |
| 0.8559027777777778 | 49.92 |
| 0.8559143518518518 | 49.919 |
| 0.8559259259259259 | 49.92 |
| 0.8559375 | 49.923 |
| 0.8559490740740742 | 49.928 |
| 0.8559606481481481 | 49.934 |
| 0.8559722222222222 | 49.939 |
| 0.8559837962962963 | 49.944 |
| 0.8559953703703704 | 49.947 |
| 0.8560069444444444 | 49.949 |
| 0.8560185185185185 | 49.949 |
| 0.8560300925925927 | 49.949 |
| 0.8560416666666667 | 49.951 |
| 0.8560532407407407 | 49.953 |
| 0.8560648148148148 | 49.952 |
| 0.8560763888888889 | 49.953 |
| 0.8560879629629629 | 49.956 |
| 0.856099537037037 | 49.961 |
| 0.8561111111111112 | 49.965 |
| 0.8561226851851852 | 49.967 |
| 0.8561342592592592 | 49.97 |
| 0.8561458333333333 | 49.974 |
| 0.8561574074074074 | 49.978 |
| 0.8561689814814816 | 49.981 |
| 0.8561805555555555 | 49.986 |
| 0.8561921296296297 | 49.989 |
| 0.8562037037037037 | 49.991 |
| 0.8562152777777778 | 49.99 |
| 0.8562268518518518 | 49.99 |
| 0.8562384259259259 | 49.989 |
| 0.8562500000000001 | 49.986 |
| 0.8562615740740741 | 49.983 |
| 0.8562731481481481 | 49.979 |
| 0.8562847222222222 | 49.977 |
| 0.8562962962962963 | 49.972 |
| 0.8563078703703703 | 49.967 |
| 0.8563194444444444 | 49.963 |
| 0.8563310185185186 | 49.96 |
| 0.8563425925925926 | 49.957 |
| 0.8563541666666666 | 49.957 |
| 0.8563657407407407 | 49.955 |
| 0.8563773148148148 | 49.952 |
| 0.856388888888889 | 49.947 |
| 0.8564004629629629 | 49.945 |
| 0.856412037037037 | 49.945 |
| 0.8564236111111111 | 49.948 |
| 0.8564351851851852 | 49.952 |
| 0.8564467592592592 | 49.954 |
| 0.8564583333333333 | 49.957 |
| 0.8564699074074075 | 49.958 |
| 0.8564814814814815 | 49.959 |
| 0.8564930555555555 | 49.958 |
| 0.8565046296296296 | 49.957 |
| 0.8565162037037037 | 49.955 |
| 0.8565277777777777 | 49.953 |
| 0.8565393518518518 | 49.952 |
| 0.856550925925926 | 49.952 |
| 0.8565625 | 49.952 |
| 0.856574074074074 | 49.951 |
| 0.8565856481481481 | 49.95 |
| 0.8565972222222222 | 49.951 |
| 0.8566087962962964 | 49.95 |
| 0.8566203703703703 | 49.951 |
| 0.8566319444444445 | 49.951 |
| 0.8566435185185185 | 49.949 |
| 0.8566550925925926 | 49.946 |
| 0.8566666666666666 | 49.944 |
| 0.8566782407407407 | 49.943 |
| 0.8566898148148149 | 49.941 |
| 0.8567013888888889 | 49.939 |
| 0.856712962962963 | 49.937 |
| 0.856724537037037 | 49.936 |
| 0.8567361111111111 | 49.936 |
| 0.8567476851851853 | 49.937 |
| 0.8567592592592592 | 49.938 |
| 0.8567708333333334 | 49.938 |
| 0.8567824074074074 | 49.938 |
| 0.8567939814814814 | 49.937 |
| 0.8568055555555555 | 49.935 |
| 0.8568171296296296 | 49.932 |
| 0.8568287037037038 | 49.93 |
| 0.8568402777777777 | 49.929 |
| 0.8568518518518519 | 49.929 |
| 0.8568634259259259 | 49.929 |
| 0.856875 | 49.931 |
| 0.856886574074074 | 49.933 |
| 0.8568981481481481 | 49.935 |
| 0.8569097222222223 | 49.935 |
| 0.8569212962962963 | 49.937 |
| 0.8569328703703704 | 49.939 |
| 0.8569444444444444 | 49.942 |
| 0.8569560185185185 | 49.944 |
| 0.8569675925925927 | 49.946 |
| 0.8569791666666666 | 49.948 |
| 0.8569907407407408 | 49.948 |
| 0.8570023148148148 | 49.947 |
| 0.857013888888889 | 49.949 |
| 0.8570254629629629 | 49.948 |
| 0.857037037037037 | 49.947 |
| 0.8570486111111112 | 49.945 |
| 0.8570601851851851 | 49.945 |
| 0.8570717592592593 | 49.944 |
| 0.8570833333333333 | 49.945 |
| 0.8570949074074075 | 49.948 |
| 0.8571064814814814 | 49.949 |
| 0.8571180555555555 | 49.952 |
| 0.8571296296296297 | 49.953 |
| 0.8571412037037037 | 49.954 |
| 0.8571527777777778 | 49.954 |
| 0.8571643518518518 | 49.952 |
| 0.857175925925926 | 49.95 |
| 0.8571875000000001 | 49.949 |
| 0.857199074074074 | 49.948 |
| 0.8572106481481482 | 49.946 |
| 0.8572222222222222 | 49.945 |
| 0.8572337962962964 | 49.947 |
| 0.8572453703703703 | 49.947 |
| 0.8572569444444444 | 49.947 |
| 0.8572685185185186 | 49.946 |
| 0.8572800925925925 | 49.945 |
| 0.8572916666666667 | 49.945 |
| 0.8573032407407407 | 49.943 |
| 0.8573148148148149 | 49.943 |
| 0.8573263888888888 | 49.942 |
| 0.8573379629629629 | 49.939 |
| 0.8573495370370371 | 49.938 |
| 0.8573611111111111 | 49.938 |
| 0.8573726851851852 | 49.938 |
| 0.8573842592592592 | 49.937 |
| 0.8573958333333334 | 49.936 |
| 0.8574074074074075 | 49.936 |
| 0.8574189814814814 | 49.936 |
| 0.8574305555555556 | 49.934 |
| 0.8574421296296296 | 49.934 |
| 0.8574537037037038 | 49.933 |
| 0.8574652777777777 | 49.933 |
| 0.8574768518518519 | 49.934 |
| 0.857488425925926 | 49.935 |
| 0.8574999999999999 | 49.937 |
| 0.8575115740740741 | 49.94 |
| 0.8575231481481481 | 49.943 |
| 0.8575347222222223 | 49.945 |
| 0.8575462962962962 | 49.946 |
| 0.8575578703703703 | 49.946 |
| 0.8575694444444445 | 49.944 |
| 0.8575810185185185 | 49.94 |
| 0.8575925925925926 | 49.938 |
| 0.8576041666666666 | 49.935 |
| 0.8576157407407408 | 49.93 |
| 0.8576273148148149 | 49.926 |
| 0.8576388888888888 | 49.922 |
| 0.857650462962963 | 49.916 |
| 0.857662037037037 | 49.911 |
| 0.8576736111111112 | 49.905 |
| 0.8576851851851851 | 49.902 |
| 0.8576967592592593 | 49.9 |
| 0.8577083333333334 | 49.9 |
| 0.8577199074074073 | 49.899 |
| 0.8577314814814815 | 49.899 |
| 0.8577430555555555 | 49.899 |
| 0.8577546296296297 | 49.898 |
| 0.8577662037037036 | 49.898 |
| 0.8577777777777778 | 49.899 |
| 0.8577893518518519 | 49.901 |
| 0.8578009259259259 | 49.903 |
| 0.8578125 | 49.904 |
| 0.857824074074074 | 49.905 |
| 0.8578356481481482 | 49.905 |
| 0.8578472222222223 | 49.906 |
| 0.8578587962962962 | 49.91 |
| 0.8578703703703704 | 49.911 |
| 0.8578819444444444 | 49.91 |
| 0.8578935185185186 | 49.909 |
| 0.8579050925925925 | 49.907 |
| 0.8579166666666667 | 49.907 |
| 0.8579282407407408 | 49.906 |
| 0.8579398148148147 | 49.906 |
| 0.8579513888888889 | 49.906 |
| 0.8579629629629629 | 49.906 |
| 0.8579745370370371 | 49.909 |
| 0.857986111111111 | 49.913 |
| 0.8579976851851852 | 49.917 |
| 0.8580092592592593 | 49.92 |
| 0.8580208333333333 | 49.924 |
| 0.8580324074074074 | 49.929 |
| 0.8580439814814814 | 49.934 |
| 0.8580555555555556 | 49.937 |
| 0.8580671296296297 | 49.94 |
| 0.8580787037037036 | 49.94 |
| 0.8580902777777778 | 49.941 |
| 0.8581018518518518 | 49.944 |
| 0.858113425925926 | 49.948 |
| 0.8581249999999999 | 49.952 |
| 0.8581365740740741 | 49.955 |
| 0.8581481481481482 | 49.958 |
| 0.8581597222222223 | 49.96 |
| 0.8581712962962963 | 49.961 |
| 0.8581828703703703 | 49.959 |
| 0.8581944444444445 | 49.956 |
| 0.8582060185185186 | 49.952 |
| 0.8582175925925926 | 49.948 |
| 0.8582291666666667 | 49.946 |
| 0.8582407407407407 | 49.945 |
| 0.8582523148148148 | 49.945 |
| 0.8582638888888888 | 49.944 |
| 0.858275462962963 | 49.943 |
| 0.8582870370370371 | 49.943 |
| 0.858298611111111 | 49.944 |
| 0.8583101851851852 | 49.947 |
| 0.8583217592592592 | 49.947 |
| 0.8583333333333334 | 49.947 |
| 0.8583449074074073 | 49.948 |
| 0.8583564814814815 | 49.95 |
| 0.8583680555555556 | 49.951 |
| 0.8583796296296297 | 49.951 |
| 0.8583912037037037 | 49.951 |
| 0.8584027777777777 | 49.951 |
| 0.8584143518518519 | 49.951 |
| 0.858425925925926 | 49.95 |
| 0.8584375 | 49.948 |
| 0.8584490740740741 | 49.946 |
| 0.8584606481481482 | 49.942 |
| 0.8584722222222222 | 49.94 |
| 0.8584837962962962 | 49.937 |
| 0.8584953703703704 | 49.933 |
| 0.8585069444444445 | 49.932 |
| 0.8585185185185185 | 49.933 |
| 0.8585300925925926 | 49.935 |
| 0.8585416666666666 | 49.938 |
| 0.8585532407407408 | 49.942 |
| 0.8585648148148147 | 49.946 |
| 0.8585763888888889 | 49.949 |
| 0.858587962962963 | 49.952 |
| 0.8585995370370371 | 49.955 |
| 0.8586111111111111 | 49.958 |
| 0.8586226851851851 | 49.96 |
| 0.8586342592592593 | 49.959 |
| 0.8586458333333334 | 49.956 |
| 0.8586574074074074 | 49.955 |
| 0.8586689814814815 | 49.952 |
| 0.8586805555555556 | 49.949 |
| 0.8586921296296296 | 49.945 |
| 0.8587037037037036 | 49.943 |
| 0.8587152777777778 | 49.941 |
| 0.8587268518518519 | 49.94 |
| 0.8587384259259259 | 49.939 |
| 0.85875 | 49.939 |
| 0.858761574074074 | 49.939 |
| 0.8587731481481482 | 49.939 |
| 0.8587847222222221 | 49.94 |
| 0.8587962962962963 | 49.943 |
| 0.8588078703703704 | 49.944 |
| 0.8588194444444445 | 49.944 |
| 0.8588310185185185 | 49.944 |
| 0.8588425925925925 | 49.945 |
| 0.8588541666666667 | 49.945 |
| 0.8588657407407408 | 49.945 |
| 0.8588773148148148 | 49.945 |
| 0.8588888888888889 | 49.947 |
| 0.858900462962963 | 49.948 |
| 0.858912037037037 | 49.948 |
| 0.858923611111111 | 49.95 |
| 0.8589351851851852 | 49.952 |
| 0.8589467592592593 | 49.952 |
| 0.8589583333333333 | 49.951 |
| 0.8589699074074074 | 49.953 |
| 0.8589814814814815 | 49.954 |
| 0.8589930555555556 | 49.955 |
| 0.8590046296296295 | 49.955 |
| 0.8590162037037037 | 49.953 |
| 0.8590277777777778 | 49.952 |
| 0.8590393518518519 | 49.951 |
| 0.8590509259259259 | 49.95 |
| 0.8590625 | 49.95 |
| 0.8590740740740741 | 49.952 |
| 0.8590856481481483 | 49.955 |
| 0.8590972222222222 | 49.96 |
| 0.8591087962962963 | 49.963 |
| 0.8591203703703704 | 49.964 |
| 0.8591319444444444 | 49.965 |
| 0.8591435185185184 | 49.966 |
| 0.8591550925925926 | 49.965 |
| 0.8591666666666667 | 49.965 |
| 0.8591782407407407 | 49.965 |
| 0.8591898148148148 | 49.965 |
| 0.8592013888888889 | 49.963 |
| 0.859212962962963 | 49.963 |
| 0.8592245370370369 | 49.962 |
| 0.8592361111111111 | 49.96 |
| 0.8592476851851852 | 49.959 |
| 0.8592592592592593 | 49.96 |
| 0.8592708333333333 | 49.961 |
| 0.8592824074074074 | 49.961 |
| 0.8592939814814815 | 49.96 |
| 0.8593055555555557 | 49.96 |
| 0.8593171296296296 | 49.958 |
| 0.8593287037037037 | 49.954 |
| 0.8593402777777778 | 49.951 |
| 0.8593518518518519 | 49.947 |
| 0.8593634259259259 | 49.942 |
| 0.859375 | 49.936 |
| 0.8593865740740741 | 49.932 |
| 0.8593981481481481 | 49.929 |
| 0.8594097222222222 | 49.923 |
| 0.8594212962962963 | 49.918 |
| 0.8594328703703704 | 49.915 |
| 0.8594444444444443 | 49.914 |
| 0.8594560185185185 | 49.913 |
| 0.8594675925925926 | 49.914 |
| 0.8594791666666667 | 49.916 |
| 0.8594907407407407 | 49.916 |
| 0.8595023148148148 | 49.914 |
| 0.8595138888888889 | 49.914 |
| 0.8595254629629631 | 49.913 |
| 0.859537037037037 | 49.913 |
| 0.8595486111111111 | 49.911 |
| 0.8595601851851852 | 49.909 |
| 0.8595717592592593 | 49.91 |
| 0.8595833333333333 | 49.908 |
| 0.8595949074074074 | 49.908 |
| 0.8596064814814816 | 49.906 |
| 0.8596180555555556 | 49.906 |
| 0.8596296296296296 | 49.903 |
| 0.8596412037037037 | 49.9 |
| 0.8596527777777778 | 49.897 |
| 0.8596643518518517 | 49.891 |
| 0.8596759259259259 | 49.886 |
| 0.8596875 | 49.88 |
| 0.8596990740740741 | 49.875 |
| 0.8597106481481481 | 49.873 |
| 0.8597222222222222 | 49.876 |
| 0.8597337962962963 | 49.88 |
| 0.8597453703703705 | 49.887 |
| 0.8597569444444444 | 49.893 |
| 0.8597685185185185 | 49.898 |
| 0.8597800925925926 | 49.904 |
| 0.8597916666666667 | 49.908 |
| 0.8598032407407407 | 49.91 |
| 0.8598148148148148 | 49.913 |
| 0.859826388888889 | 49.911 |
| 0.859837962962963 | 49.909 |
| 0.859849537037037 | 49.906 |
| 0.8598611111111111 | 49.903 |
| 0.8598726851851852 | 49.901 |
| 0.8598842592592592 | 49.9 |
| 0.8598958333333333 | 49.899 |
| 0.8599074074074075 | 49.897 |
| 0.8599189814814815 | 49.895 |
| 0.8599305555555555 | 49.895 |
| 0.8599421296296296 | 49.895 |
| 0.8599537037037037 | 49.897 |
| 0.8599652777777779 | 49.897 |
| 0.8599768518518518 | 49.898 |
| 0.859988425925926 | 49.897 |
| 0.86 | 49.895 |
| 0.8600115740740741 | 49.894 |
| 0.8600231481481481 | 49.895 |
| 0.8600347222222222 | 49.896 |
| 0.8600462962962964 | 49.898 |
| 0.8600578703703704 | 49.898 |
| 0.8600694444444444 | 49.899 |
| 0.8600810185185185 | 49.899 |
| 0.8600925925925926 | 49.9 |
| 0.8601041666666666 | 49.901 |
| 0.8601157407407407 | 49.901 |
| 0.8601273148148149 | 49.901 |
| 0.8601388888888889 | 49.902 |
| 0.8601504629629629 | 49.903 |
| 0.860162037037037 | 49.901 |
| 0.8601736111111111 | 49.9 |
| 0.8601851851851853 | 49.899 |
| 0.8601967592592592 | 49.896 |
| 0.8602083333333334 | 49.895 |
| 0.8602199074074074 | 49.895 |
| 0.8602314814814815 | 49.896 |
| 0.8602430555555555 | 49.896 |
| 0.8602546296296296 | 49.895 |
| 0.8602662037037038 | 49.895 |
| 0.8602777777777778 | 49.892 |
| 0.8602893518518518 | 49.895 |
| 0.8603009259259259 | 49.894 |
| 0.8603125 | 49.893 |
| 0.860324074074074 | 49.892 |
| 0.8603356481481481 | 49.892 |
| 0.8603472222222223 | 49.896 |
| 0.8603587962962963 | 49.9 |
| 0.8603703703703703 | 49.902 |
| 0.8603819444444444 | 49.902 |
| 0.8603935185185185 | 49.901 |
| 0.8604050925925927 | 49.899 |
| 0.8604166666666666 | 49.895 |
| 0.8604282407407408 | 49.894 |
| 0.8604398148148148 | 49.895 |
| 0.860451388888889 | 49.896 |
| 0.8604629629629629 | 49.896 |
| 0.860474537037037 | 49.898 |
| 0.8604861111111112 | 49.899 |
| 0.8604976851851852 | 49.901 |
| 0.8605092592592593 | 49.901 |
| 0.8605208333333333 | 49.902 |
| 0.8605324074074074 | 49.906 |
| 0.8605439814814814 | 49.909 |
| 0.8605555555555555 | 49.911 |
| 0.8605671296296297 | 49.911 |
| 0.8605787037037037 | 49.912 |
| 0.8605902777777777 | 49.911 |
| 0.8606018518518518 | 49.91 |
| 0.8606134259259259 | 49.909 |
| 0.8606250000000001 | 49.907 |
| 0.860636574074074 | 49.907 |
| 0.8606481481481482 | 49.905 |
| 0.8606597222222222 | 49.904 |
| 0.8606712962962964 | 49.903 |
| 0.8606828703703703 | 49.904 |
| 0.8606944444444444 | 49.905 |
| 0.8607060185185186 | 49.906 |
| 0.8607175925925926 | 49.907 |
| 0.8607291666666667 | 49.908 |
| 0.8607407407407407 | 49.91 |
| 0.8607523148148148 | 49.912 |
| 0.860763888888889 | 49.915 |
| 0.8607754629629629 | 49.916 |
| 0.8607870370370371 | 49.916 |
| 0.8607986111111111 | 49.915 |
| 0.8608101851851853 | 49.915 |
| 0.8608217592592592 | 49.917 |
| 0.8608333333333333 | 49.918 |
| 0.8608449074074075 | 49.917 |
| 0.8608564814814814 | 49.916 |
| 0.8608680555555556 | 49.915 |
| 0.8608796296296296 | 49.914 |
| 0.8608912037037038 | 49.912 |
| 0.8609027777777777 | 49.912 |
| 0.8609143518518518 | 49.913 |
| 0.860925925925926 | 49.914 |
| 0.8609375 | 49.915 |
| 0.8609490740740741 | 49.916 |
| 0.8609606481481481 | 49.916 |
| 0.8609722222222222 | 49.913 |
| 0.8609837962962964 | 49.909 |
| 0.8609953703703703 | 49.906 |
| 0.8610069444444445 | 49.904 |
| 0.8610185185185185 | 49.901 |
| 0.8610300925925927 | 49.898 |
| 0.8610416666666666 | 49.897 |
| 0.8610532407407407 | 49.894 |
| 0.8610648148148149 | 49.893 |
| 0.8610763888888888 | 49.893 |
| 0.861087962962963 | 49.891 |
| 0.861099537037037 | 49.887 |
| 0.8611111111111112 | 49.881 |
| 0.8611226851851851 | 49.877 |
| 0.8611342592592592 | 49.873 |
| 0.8611458333333334 | 49.871 |
| 0.8611574074074074 | 49.87 |
| 0.8611689814814815 | 49.87 |
| 0.8611805555555555 | 49.87 |
| 0.8611921296296297 | 49.87 |
| 0.8612037037037038 | 49.869 |
| 0.8612152777777777 | 49.869 |
| 0.8612268518518519 | 49.868 |
| 0.8612384259259259 | 49.868 |
| 0.8612500000000001 | 49.867 |
| 0.861261574074074 | 49.868 |
| 0.8612731481481481 | 49.87 |
| 0.8612847222222223 | 49.871 |
| 0.8612962962962962 | 49.87 |
| 0.8613078703703704 | 49.87 |
| 0.8613194444444444 | 49.869 |
| 0.8613310185185186 | 49.867 |
| 0.8613425925925925 | 49.865 |
| 0.8613541666666666 | 49.866 |
| 0.8613657407407408 | 49.866 |
| 0.8613773148148148 | 49.866 |
| 0.8613888888888889 | 49.866 |
| 0.8614004629629629 | 49.865 |
| 0.8614120370370371 | 49.862 |
| 0.8614236111111112 | 49.859 |
| 0.8614351851851851 | 49.857 |
| 0.8614467592592593 | 49.857 |
| 0.8614583333333333 | 49.856 |
| 0.8614699074074075 | 49.856 |
| 0.8614814814814814 | 49.859 |
| 0.8614930555555556 | 49.861 |
| 0.8615046296296297 | 49.864 |
| 0.8615162037037036 | 49.866 |
| 0.8615277777777778 | 49.866 |
| 0.8615393518518518 | 49.869 |
| 0.861550925925926 | 49.871 |
| 0.8615624999999999 | 49.873 |
| 0.861574074074074 | 49.877 |
| 0.8615856481481482 | 49.879 |
| 0.8615972222222222 | 49.882 |
| 0.8616087962962963 | 49.885 |
| 0.8616203703703703 | 49.888 |
| 0.8616319444444445 | 49.89 |
| 0.8616435185185186 | 49.893 |
| 0.8616550925925925 | 49.894 |
| 0.8616666666666667 | 49.894 |
| 0.8616782407407407 | 49.893 |
| 0.8616898148148149 | 49.891 |
| 0.8617013888888888 | 49.889 |
| 0.861712962962963 | 49.888 |
| 0.8617245370370371 | 49.887 |
| 0.861736111111111 | 49.885 |
| 0.8617476851851852 | 49.886 |
| 0.8617592592592592 | 49.888 |
| 0.8617708333333334 | 49.888 |
| 0.8617824074074073 | 49.89 |
| 0.8617939814814815 | 49.89 |
| 0.8618055555555556 | 49.891 |
| 0.8618171296296296 | 49.89 |
| 0.8618287037037037 | 49.89 |
| 0.8618402777777777 | 49.891 |
| 0.8618518518518519 | 49.893 |
| 0.861863425925926 | 49.894 |
| 0.861875 | 49.894 |
| 0.8618865740740741 | 49.894 |
| 0.8618981481481481 | 49.893 |
| 0.8619097222222223 | 49.891 |
| 0.8619212962962962 | 49.888 |
| 0.8619328703703704 | 49.885 |
| 0.8619444444444445 | 49.885 |
| 0.8619560185185186 | 49.887 |
| 0.8619675925925926 | 49.887 |
| 0.8619791666666666 | 49.888 |
| 0.8619907407407408 | 49.89 |
| 0.8620023148148147 | 49.89 |
| 0.8620138888888889 | 49.892 |
| 0.862025462962963 | 49.892 |
| 0.862037037037037 | 49.892 |
| 0.8620486111111111 | 49.89 |
| 0.8620601851851851 | 49.889 |
| 0.8620717592592593 | 49.888 |
| 0.8620833333333334 | 49.887 |
| 0.8620949074074074 | 49.886 |
| 0.8621064814814815 | 49.884 |
| 0.8621180555555555 | 49.885 |
| 0.8621296296296297 | 49.887 |
| 0.8621412037037036 | 49.889 |
| 0.8621527777777778 | 49.894 |
| 0.8621643518518519 | 49.897 |
| 0.862175925925926 | 49.901 |
| 0.8621875 | 49.902 |
| 0.862199074074074 | 49.903 |
| 0.8622106481481482 | 49.905 |
| 0.8622222222222223 | 49.906 |
| 0.8622337962962963 | 49.908 |
| 0.8622453703703704 | 49.909 |
| 0.8622569444444445 | 49.911 |
| 0.8622685185185185 | 49.911 |
| 0.8622800925925925 | 49.912 |
| 0.8622916666666667 | 49.913 |
| 0.8623032407407408 | 49.915 |
| 0.8623148148148148 | 49.916 |
| 0.8623263888888889 | 49.918 |
| 0.862337962962963 | 49.919 |
| 0.8623495370370371 | 49.919 |
| 0.862361111111111 | 49.919 |
| 0.8623726851851852 | 49.919 |
| 0.8623842592592593 | 49.92 |
| 0.8623958333333334 | 49.921 |
| 0.8624074074074074 | 49.923 |
| 0.8624189814814814 | 49.926 |
| 0.8624305555555556 | 49.93 |
| 0.8624421296296297 | 49.932 |
| 0.8624537037037037 | 49.933 |
| 0.8624652777777778 | 49.933 |
| 0.8624768518518519 | 49.932 |
| 0.8624884259259259 | 49.932 |
| 0.8624999999999999 | 49.932 |
| 0.8625115740740741 | 49.932 |
| 0.8625231481481482 | 49.932 |
| 0.8625347222222222 | 49.933 |
| 0.8625462962962963 | 49.935 |
| 0.8625578703703703 | 49.936 |
| 0.8625694444444445 | 49.938 |
| 0.8625810185185184 | 49.94 |
| 0.8625925925925926 | 49.943 |
| 0.8626041666666667 | 49.944 |
| 0.8626157407407408 | 49.945 |
| 0.8626273148148148 | 49.948 |
| 0.8626388888888888 | 49.948 |
| 0.862650462962963 | 49.949 |
| 0.8626620370370371 | 49.948 |
| 0.8626736111111111 | 49.949 |
| 0.8626851851851852 | 49.951 |
| 0.8626967592592593 | 49.953 |
| 0.8627083333333333 | 49.956 |
| 0.8627199074074073 | 49.957 |
| 0.8627314814814815 | 49.959 |
| 0.8627430555555556 | 49.959 |
| 0.8627546296296296 | 49.96 |
| 0.8627662037037037 | 49.961 |
| 0.8627777777777778 | 49.961 |
| 0.8627893518518519 | 49.959 |
| 0.8628009259259258 | 49.957 |
| 0.8628125 | 49.956 |
| 0.8628240740740741 | 49.955 |
| 0.8628356481481482 | 49.955 |
| 0.8628472222222222 | 49.957 |
| 0.8628587962962962 | 49.958 |
| 0.8628703703703704 | 49.96 |
| 0.8628819444444445 | 49.962 |
| 0.8628935185185185 | 49.965 |
| 0.8629050925925926 | 49.97 |
| 0.8629166666666667 | 49.975 |
| 0.8629282407407407 | 49.979 |
| 0.8629398148148147 | 49.982 |
| 0.8629513888888889 | 49.984 |
| 0.862962962962963 | 49.984 |
| 0.862974537037037 | 49.986 |
| 0.8629861111111111 | 49.986 |
| 0.8629976851851852 | 49.986 |
| 0.8630092592592593 | 49.984 |
| 0.8630208333333332 | 49.984 |
| 0.8630324074074074 | 49.988 |
| 0.8630439814814815 | 49.991 |
| 0.8630555555555556 | 49.995 |
| 0.8630671296296296 | 49.999 |
| 0.8630787037037037 | 50.002 |
| 0.8630902777777778 | 50.007 |
| 0.863101851851852 | 50.01 |
| 0.8631134259259259 | 50.012 |
| 0.863125 | 50.012 |
| 0.8631365740740741 | 50.011 |
| 0.8631481481481481 | 50.009 |
| 0.8631597222222221 | 50.008 |
| 0.8631712962962963 | 50.009 |
| 0.8631828703703704 | 50.008 |